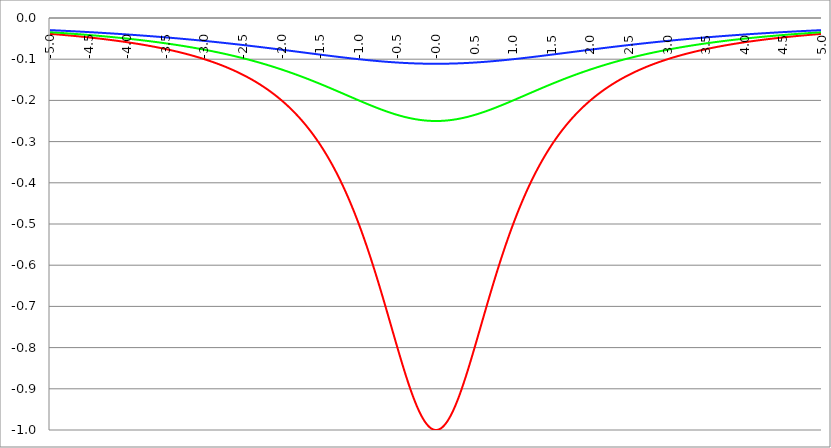
| Category | Series 1 | Series 0 | Series 2 |
|---|---|---|---|
| -5.0 | -0.038 | -0.034 | -0.029 |
| -4.995 | -0.039 | -0.035 | -0.029 |
| -4.99 | -0.039 | -0.035 | -0.029 |
| -4.985 | -0.039 | -0.035 | -0.03 |
| -4.98 | -0.039 | -0.035 | -0.03 |
| -4.975 | -0.039 | -0.035 | -0.03 |
| -4.97 | -0.039 | -0.035 | -0.03 |
| -4.965000000000001 | -0.039 | -0.035 | -0.03 |
| -4.960000000000001 | -0.039 | -0.035 | -0.03 |
| -4.955000000000001 | -0.039 | -0.035 | -0.03 |
| -4.950000000000001 | -0.039 | -0.035 | -0.03 |
| -4.945000000000001 | -0.039 | -0.035 | -0.03 |
| -4.940000000000001 | -0.039 | -0.035 | -0.03 |
| -4.935000000000001 | -0.039 | -0.035 | -0.03 |
| -4.930000000000001 | -0.04 | -0.035 | -0.03 |
| -4.925000000000002 | -0.04 | -0.035 | -0.03 |
| -4.920000000000002 | -0.04 | -0.035 | -0.03 |
| -4.915000000000002 | -0.04 | -0.036 | -0.03 |
| -4.910000000000002 | -0.04 | -0.036 | -0.03 |
| -4.905000000000002 | -0.04 | -0.036 | -0.03 |
| -4.900000000000002 | -0.04 | -0.036 | -0.03 |
| -4.895000000000002 | -0.04 | -0.036 | -0.03 |
| -4.890000000000002 | -0.04 | -0.036 | -0.03 |
| -4.885000000000002 | -0.04 | -0.036 | -0.03 |
| -4.880000000000002 | -0.04 | -0.036 | -0.03 |
| -4.875000000000003 | -0.04 | -0.036 | -0.031 |
| -4.870000000000003 | -0.04 | -0.036 | -0.031 |
| -4.865000000000003 | -0.041 | -0.036 | -0.031 |
| -4.860000000000003 | -0.041 | -0.036 | -0.031 |
| -4.855000000000003 | -0.041 | -0.036 | -0.031 |
| -4.850000000000003 | -0.041 | -0.036 | -0.031 |
| -4.845000000000003 | -0.041 | -0.036 | -0.031 |
| -4.840000000000003 | -0.041 | -0.036 | -0.031 |
| -4.835000000000003 | -0.041 | -0.037 | -0.031 |
| -4.830000000000004 | -0.041 | -0.037 | -0.031 |
| -4.825000000000004 | -0.041 | -0.037 | -0.031 |
| -4.820000000000004 | -0.041 | -0.037 | -0.031 |
| -4.815000000000004 | -0.041 | -0.037 | -0.031 |
| -4.810000000000004 | -0.041 | -0.037 | -0.031 |
| -4.805000000000004 | -0.042 | -0.037 | -0.031 |
| -4.800000000000004 | -0.042 | -0.037 | -0.031 |
| -4.795000000000004 | -0.042 | -0.037 | -0.031 |
| -4.790000000000004 | -0.042 | -0.037 | -0.031 |
| -4.785000000000004 | -0.042 | -0.037 | -0.031 |
| -4.780000000000004 | -0.042 | -0.037 | -0.031 |
| -4.775000000000004 | -0.042 | -0.037 | -0.031 |
| -4.770000000000004 | -0.042 | -0.037 | -0.031 |
| -4.765000000000005 | -0.042 | -0.037 | -0.032 |
| -4.760000000000005 | -0.042 | -0.038 | -0.032 |
| -4.755000000000005 | -0.042 | -0.038 | -0.032 |
| -4.750000000000005 | -0.042 | -0.038 | -0.032 |
| -4.745000000000005 | -0.043 | -0.038 | -0.032 |
| -4.740000000000005 | -0.043 | -0.038 | -0.032 |
| -4.735000000000005 | -0.043 | -0.038 | -0.032 |
| -4.730000000000005 | -0.043 | -0.038 | -0.032 |
| -4.725000000000006 | -0.043 | -0.038 | -0.032 |
| -4.720000000000006 | -0.043 | -0.038 | -0.032 |
| -4.715000000000006 | -0.043 | -0.038 | -0.032 |
| -4.710000000000006 | -0.043 | -0.038 | -0.032 |
| -4.705000000000006 | -0.043 | -0.038 | -0.032 |
| -4.700000000000006 | -0.043 | -0.038 | -0.032 |
| -4.695000000000006 | -0.043 | -0.038 | -0.032 |
| -4.690000000000006 | -0.043 | -0.038 | -0.032 |
| -4.685000000000007 | -0.044 | -0.039 | -0.032 |
| -4.680000000000007 | -0.044 | -0.039 | -0.032 |
| -4.675000000000007 | -0.044 | -0.039 | -0.032 |
| -4.670000000000007 | -0.044 | -0.039 | -0.032 |
| -4.665000000000007 | -0.044 | -0.039 | -0.033 |
| -4.660000000000007 | -0.044 | -0.039 | -0.033 |
| -4.655000000000007 | -0.044 | -0.039 | -0.033 |
| -4.650000000000007 | -0.044 | -0.039 | -0.033 |
| -4.645000000000007 | -0.044 | -0.039 | -0.033 |
| -4.640000000000008 | -0.044 | -0.039 | -0.033 |
| -4.635000000000008 | -0.044 | -0.039 | -0.033 |
| -4.630000000000008 | -0.045 | -0.039 | -0.033 |
| -4.625000000000008 | -0.045 | -0.039 | -0.033 |
| -4.620000000000008 | -0.045 | -0.039 | -0.033 |
| -4.615000000000008 | -0.045 | -0.04 | -0.033 |
| -4.610000000000008 | -0.045 | -0.04 | -0.033 |
| -4.605000000000008 | -0.045 | -0.04 | -0.033 |
| -4.600000000000008 | -0.045 | -0.04 | -0.033 |
| -4.595000000000009 | -0.045 | -0.04 | -0.033 |
| -4.590000000000009 | -0.045 | -0.04 | -0.033 |
| -4.585000000000009 | -0.045 | -0.04 | -0.033 |
| -4.580000000000009 | -0.046 | -0.04 | -0.033 |
| -4.57500000000001 | -0.046 | -0.04 | -0.033 |
| -4.57000000000001 | -0.046 | -0.04 | -0.033 |
| -4.565000000000009 | -0.046 | -0.04 | -0.034 |
| -4.560000000000009 | -0.046 | -0.04 | -0.034 |
| -4.555000000000009 | -0.046 | -0.04 | -0.034 |
| -4.55000000000001 | -0.046 | -0.04 | -0.034 |
| -4.54500000000001 | -0.046 | -0.041 | -0.034 |
| -4.54000000000001 | -0.046 | -0.041 | -0.034 |
| -4.53500000000001 | -0.046 | -0.041 | -0.034 |
| -4.53000000000001 | -0.046 | -0.041 | -0.034 |
| -4.52500000000001 | -0.047 | -0.041 | -0.034 |
| -4.52000000000001 | -0.047 | -0.041 | -0.034 |
| -4.51500000000001 | -0.047 | -0.041 | -0.034 |
| -4.51000000000001 | -0.047 | -0.041 | -0.034 |
| -4.505000000000011 | -0.047 | -0.041 | -0.034 |
| -4.500000000000011 | -0.047 | -0.041 | -0.034 |
| -4.495000000000011 | -0.047 | -0.041 | -0.034 |
| -4.490000000000011 | -0.047 | -0.041 | -0.034 |
| -4.485000000000011 | -0.047 | -0.041 | -0.034 |
| -4.480000000000011 | -0.047 | -0.042 | -0.034 |
| -4.475000000000011 | -0.048 | -0.042 | -0.034 |
| -4.470000000000011 | -0.048 | -0.042 | -0.035 |
| -4.465000000000011 | -0.048 | -0.042 | -0.035 |
| -4.460000000000011 | -0.048 | -0.042 | -0.035 |
| -4.455000000000012 | -0.048 | -0.042 | -0.035 |
| -4.450000000000012 | -0.048 | -0.042 | -0.035 |
| -4.445000000000012 | -0.048 | -0.042 | -0.035 |
| -4.440000000000012 | -0.048 | -0.042 | -0.035 |
| -4.435000000000012 | -0.048 | -0.042 | -0.035 |
| -4.430000000000012 | -0.048 | -0.042 | -0.035 |
| -4.425000000000012 | -0.049 | -0.042 | -0.035 |
| -4.420000000000012 | -0.049 | -0.042 | -0.035 |
| -4.415000000000012 | -0.049 | -0.043 | -0.035 |
| -4.410000000000013 | -0.049 | -0.043 | -0.035 |
| -4.405000000000013 | -0.049 | -0.043 | -0.035 |
| -4.400000000000013 | -0.049 | -0.043 | -0.035 |
| -4.395000000000013 | -0.049 | -0.043 | -0.035 |
| -4.390000000000013 | -0.049 | -0.043 | -0.035 |
| -4.385000000000013 | -0.049 | -0.043 | -0.035 |
| -4.380000000000013 | -0.05 | -0.043 | -0.035 |
| -4.375000000000013 | -0.05 | -0.043 | -0.036 |
| -4.370000000000013 | -0.05 | -0.043 | -0.036 |
| -4.365000000000013 | -0.05 | -0.043 | -0.036 |
| -4.360000000000014 | -0.05 | -0.043 | -0.036 |
| -4.355000000000014 | -0.05 | -0.044 | -0.036 |
| -4.350000000000014 | -0.05 | -0.044 | -0.036 |
| -4.345000000000014 | -0.05 | -0.044 | -0.036 |
| -4.340000000000014 | -0.05 | -0.044 | -0.036 |
| -4.335000000000014 | -0.051 | -0.044 | -0.036 |
| -4.330000000000014 | -0.051 | -0.044 | -0.036 |
| -4.325000000000014 | -0.051 | -0.044 | -0.036 |
| -4.320000000000014 | -0.051 | -0.044 | -0.036 |
| -4.315000000000015 | -0.051 | -0.044 | -0.036 |
| -4.310000000000015 | -0.051 | -0.044 | -0.036 |
| -4.305000000000015 | -0.051 | -0.044 | -0.036 |
| -4.300000000000015 | -0.051 | -0.044 | -0.036 |
| -4.295000000000015 | -0.051 | -0.045 | -0.036 |
| -4.290000000000015 | -0.052 | -0.045 | -0.036 |
| -4.285000000000015 | -0.052 | -0.045 | -0.037 |
| -4.280000000000015 | -0.052 | -0.045 | -0.037 |
| -4.275000000000015 | -0.052 | -0.045 | -0.037 |
| -4.270000000000015 | -0.052 | -0.045 | -0.037 |
| -4.265000000000016 | -0.052 | -0.045 | -0.037 |
| -4.260000000000016 | -0.052 | -0.045 | -0.037 |
| -4.255000000000016 | -0.052 | -0.045 | -0.037 |
| -4.250000000000016 | -0.052 | -0.045 | -0.037 |
| -4.245000000000016 | -0.053 | -0.045 | -0.037 |
| -4.240000000000016 | -0.053 | -0.046 | -0.037 |
| -4.235000000000016 | -0.053 | -0.046 | -0.037 |
| -4.230000000000016 | -0.053 | -0.046 | -0.037 |
| -4.225000000000017 | -0.053 | -0.046 | -0.037 |
| -4.220000000000017 | -0.053 | -0.046 | -0.037 |
| -4.215000000000017 | -0.053 | -0.046 | -0.037 |
| -4.210000000000017 | -0.053 | -0.046 | -0.037 |
| -4.205000000000017 | -0.054 | -0.046 | -0.037 |
| -4.200000000000017 | -0.054 | -0.046 | -0.038 |
| -4.195000000000017 | -0.054 | -0.046 | -0.038 |
| -4.190000000000017 | -0.054 | -0.046 | -0.038 |
| -4.185000000000017 | -0.054 | -0.046 | -0.038 |
| -4.180000000000017 | -0.054 | -0.047 | -0.038 |
| -4.175000000000018 | -0.054 | -0.047 | -0.038 |
| -4.170000000000018 | -0.054 | -0.047 | -0.038 |
| -4.165000000000018 | -0.055 | -0.047 | -0.038 |
| -4.160000000000018 | -0.055 | -0.047 | -0.038 |
| -4.155000000000018 | -0.055 | -0.047 | -0.038 |
| -4.150000000000018 | -0.055 | -0.047 | -0.038 |
| -4.145000000000018 | -0.055 | -0.047 | -0.038 |
| -4.140000000000018 | -0.055 | -0.047 | -0.038 |
| -4.135000000000018 | -0.055 | -0.047 | -0.038 |
| -4.130000000000019 | -0.055 | -0.047 | -0.038 |
| -4.125000000000019 | -0.056 | -0.048 | -0.038 |
| -4.120000000000019 | -0.056 | -0.048 | -0.038 |
| -4.115000000000019 | -0.056 | -0.048 | -0.039 |
| -4.110000000000019 | -0.056 | -0.048 | -0.039 |
| -4.105000000000019 | -0.056 | -0.048 | -0.039 |
| -4.100000000000019 | -0.056 | -0.048 | -0.039 |
| -4.095000000000019 | -0.056 | -0.048 | -0.039 |
| -4.090000000000019 | -0.056 | -0.048 | -0.039 |
| -4.085000000000019 | -0.057 | -0.048 | -0.039 |
| -4.08000000000002 | -0.057 | -0.048 | -0.039 |
| -4.07500000000002 | -0.057 | -0.049 | -0.039 |
| -4.07000000000002 | -0.057 | -0.049 | -0.039 |
| -4.06500000000002 | -0.057 | -0.049 | -0.039 |
| -4.06000000000002 | -0.057 | -0.049 | -0.039 |
| -4.05500000000002 | -0.057 | -0.049 | -0.039 |
| -4.05000000000002 | -0.057 | -0.049 | -0.039 |
| -4.04500000000002 | -0.058 | -0.049 | -0.039 |
| -4.04000000000002 | -0.058 | -0.049 | -0.039 |
| -4.03500000000002 | -0.058 | -0.049 | -0.04 |
| -4.03000000000002 | -0.058 | -0.049 | -0.04 |
| -4.025000000000021 | -0.058 | -0.05 | -0.04 |
| -4.020000000000021 | -0.058 | -0.05 | -0.04 |
| -4.015000000000021 | -0.058 | -0.05 | -0.04 |
| -4.010000000000021 | -0.059 | -0.05 | -0.04 |
| -4.005000000000021 | -0.059 | -0.05 | -0.04 |
| -4.000000000000021 | -0.059 | -0.05 | -0.04 |
| -3.995000000000021 | -0.059 | -0.05 | -0.04 |
| -3.990000000000021 | -0.059 | -0.05 | -0.04 |
| -3.985000000000022 | -0.059 | -0.05 | -0.04 |
| -3.980000000000022 | -0.059 | -0.05 | -0.04 |
| -3.975000000000022 | -0.06 | -0.051 | -0.04 |
| -3.970000000000022 | -0.06 | -0.051 | -0.04 |
| -3.965000000000022 | -0.06 | -0.051 | -0.04 |
| -3.960000000000022 | -0.06 | -0.051 | -0.041 |
| -3.955000000000022 | -0.06 | -0.051 | -0.041 |
| -3.950000000000022 | -0.06 | -0.051 | -0.041 |
| -3.945000000000022 | -0.06 | -0.051 | -0.041 |
| -3.940000000000023 | -0.061 | -0.051 | -0.041 |
| -3.935000000000023 | -0.061 | -0.051 | -0.041 |
| -3.930000000000023 | -0.061 | -0.051 | -0.041 |
| -3.925000000000023 | -0.061 | -0.052 | -0.041 |
| -3.920000000000023 | -0.061 | -0.052 | -0.041 |
| -3.915000000000023 | -0.061 | -0.052 | -0.041 |
| -3.910000000000023 | -0.061 | -0.052 | -0.041 |
| -3.905000000000023 | -0.062 | -0.052 | -0.041 |
| -3.900000000000023 | -0.062 | -0.052 | -0.041 |
| -3.895000000000023 | -0.062 | -0.052 | -0.041 |
| -3.890000000000024 | -0.062 | -0.052 | -0.041 |
| -3.885000000000024 | -0.062 | -0.052 | -0.042 |
| -3.880000000000024 | -0.062 | -0.052 | -0.042 |
| -3.875000000000024 | -0.062 | -0.053 | -0.042 |
| -3.870000000000024 | -0.063 | -0.053 | -0.042 |
| -3.865000000000024 | -0.063 | -0.053 | -0.042 |
| -3.860000000000024 | -0.063 | -0.053 | -0.042 |
| -3.855000000000024 | -0.063 | -0.053 | -0.042 |
| -3.850000000000024 | -0.063 | -0.053 | -0.042 |
| -3.845000000000025 | -0.063 | -0.053 | -0.042 |
| -3.840000000000025 | -0.064 | -0.053 | -0.042 |
| -3.835000000000025 | -0.064 | -0.053 | -0.042 |
| -3.830000000000025 | -0.064 | -0.054 | -0.042 |
| -3.825000000000025 | -0.064 | -0.054 | -0.042 |
| -3.820000000000025 | -0.064 | -0.054 | -0.042 |
| -3.815000000000025 | -0.064 | -0.054 | -0.042 |
| -3.810000000000025 | -0.064 | -0.054 | -0.043 |
| -3.805000000000025 | -0.065 | -0.054 | -0.043 |
| -3.800000000000026 | -0.065 | -0.054 | -0.043 |
| -3.795000000000026 | -0.065 | -0.054 | -0.043 |
| -3.790000000000026 | -0.065 | -0.054 | -0.043 |
| -3.785000000000026 | -0.065 | -0.055 | -0.043 |
| -3.780000000000026 | -0.065 | -0.055 | -0.043 |
| -3.775000000000026 | -0.066 | -0.055 | -0.043 |
| -3.770000000000026 | -0.066 | -0.055 | -0.043 |
| -3.765000000000026 | -0.066 | -0.055 | -0.043 |
| -3.760000000000026 | -0.066 | -0.055 | -0.043 |
| -3.755000000000026 | -0.066 | -0.055 | -0.043 |
| -3.750000000000027 | -0.066 | -0.055 | -0.043 |
| -3.745000000000027 | -0.067 | -0.055 | -0.043 |
| -3.740000000000027 | -0.067 | -0.056 | -0.044 |
| -3.735000000000027 | -0.067 | -0.056 | -0.044 |
| -3.730000000000027 | -0.067 | -0.056 | -0.044 |
| -3.725000000000027 | -0.067 | -0.056 | -0.044 |
| -3.720000000000027 | -0.067 | -0.056 | -0.044 |
| -3.715000000000027 | -0.068 | -0.056 | -0.044 |
| -3.710000000000027 | -0.068 | -0.056 | -0.044 |
| -3.705000000000028 | -0.068 | -0.056 | -0.044 |
| -3.700000000000028 | -0.068 | -0.057 | -0.044 |
| -3.695000000000028 | -0.068 | -0.057 | -0.044 |
| -3.690000000000028 | -0.068 | -0.057 | -0.044 |
| -3.685000000000028 | -0.069 | -0.057 | -0.044 |
| -3.680000000000028 | -0.069 | -0.057 | -0.044 |
| -3.675000000000028 | -0.069 | -0.057 | -0.044 |
| -3.670000000000028 | -0.069 | -0.057 | -0.045 |
| -3.665000000000028 | -0.069 | -0.057 | -0.045 |
| -3.660000000000028 | -0.069 | -0.057 | -0.045 |
| -3.655000000000029 | -0.07 | -0.058 | -0.045 |
| -3.650000000000029 | -0.07 | -0.058 | -0.045 |
| -3.645000000000029 | -0.07 | -0.058 | -0.045 |
| -3.640000000000029 | -0.07 | -0.058 | -0.045 |
| -3.635000000000029 | -0.07 | -0.058 | -0.045 |
| -3.630000000000029 | -0.071 | -0.058 | -0.045 |
| -3.625000000000029 | -0.071 | -0.058 | -0.045 |
| -3.620000000000029 | -0.071 | -0.058 | -0.045 |
| -3.615000000000029 | -0.071 | -0.059 | -0.045 |
| -3.61000000000003 | -0.071 | -0.059 | -0.045 |
| -3.60500000000003 | -0.071 | -0.059 | -0.045 |
| -3.60000000000003 | -0.072 | -0.059 | -0.046 |
| -3.59500000000003 | -0.072 | -0.059 | -0.046 |
| -3.59000000000003 | -0.072 | -0.059 | -0.046 |
| -3.58500000000003 | -0.072 | -0.059 | -0.046 |
| -3.58000000000003 | -0.072 | -0.059 | -0.046 |
| -3.57500000000003 | -0.073 | -0.06 | -0.046 |
| -3.57000000000003 | -0.073 | -0.06 | -0.046 |
| -3.565000000000031 | -0.073 | -0.06 | -0.046 |
| -3.560000000000031 | -0.073 | -0.06 | -0.046 |
| -3.555000000000031 | -0.073 | -0.06 | -0.046 |
| -3.550000000000031 | -0.074 | -0.06 | -0.046 |
| -3.545000000000031 | -0.074 | -0.06 | -0.046 |
| -3.540000000000031 | -0.074 | -0.06 | -0.046 |
| -3.535000000000031 | -0.074 | -0.061 | -0.047 |
| -3.530000000000031 | -0.074 | -0.061 | -0.047 |
| -3.525000000000031 | -0.074 | -0.061 | -0.047 |
| -3.520000000000032 | -0.075 | -0.061 | -0.047 |
| -3.515000000000032 | -0.075 | -0.061 | -0.047 |
| -3.510000000000032 | -0.075 | -0.061 | -0.047 |
| -3.505000000000032 | -0.075 | -0.061 | -0.047 |
| -3.500000000000032 | -0.075 | -0.062 | -0.047 |
| -3.495000000000032 | -0.076 | -0.062 | -0.047 |
| -3.490000000000032 | -0.076 | -0.062 | -0.047 |
| -3.485000000000032 | -0.076 | -0.062 | -0.047 |
| -3.480000000000032 | -0.076 | -0.062 | -0.047 |
| -3.475000000000032 | -0.076 | -0.062 | -0.047 |
| -3.470000000000033 | -0.077 | -0.062 | -0.048 |
| -3.465000000000033 | -0.077 | -0.062 | -0.048 |
| -3.460000000000033 | -0.077 | -0.063 | -0.048 |
| -3.455000000000033 | -0.077 | -0.063 | -0.048 |
| -3.450000000000033 | -0.078 | -0.063 | -0.048 |
| -3.445000000000033 | -0.078 | -0.063 | -0.048 |
| -3.440000000000033 | -0.078 | -0.063 | -0.048 |
| -3.435000000000033 | -0.078 | -0.063 | -0.048 |
| -3.430000000000033 | -0.078 | -0.063 | -0.048 |
| -3.425000000000034 | -0.079 | -0.064 | -0.048 |
| -3.420000000000034 | -0.079 | -0.064 | -0.048 |
| -3.415000000000034 | -0.079 | -0.064 | -0.048 |
| -3.410000000000034 | -0.079 | -0.064 | -0.048 |
| -3.405000000000034 | -0.079 | -0.064 | -0.049 |
| -3.400000000000034 | -0.08 | -0.064 | -0.049 |
| -3.395000000000034 | -0.08 | -0.064 | -0.049 |
| -3.390000000000034 | -0.08 | -0.065 | -0.049 |
| -3.385000000000034 | -0.08 | -0.065 | -0.049 |
| -3.380000000000034 | -0.08 | -0.065 | -0.049 |
| -3.375000000000035 | -0.081 | -0.065 | -0.049 |
| -3.370000000000035 | -0.081 | -0.065 | -0.049 |
| -3.365000000000035 | -0.081 | -0.065 | -0.049 |
| -3.360000000000035 | -0.081 | -0.065 | -0.049 |
| -3.355000000000035 | -0.082 | -0.066 | -0.049 |
| -3.350000000000035 | -0.082 | -0.066 | -0.049 |
| -3.345000000000035 | -0.082 | -0.066 | -0.05 |
| -3.340000000000035 | -0.082 | -0.066 | -0.05 |
| -3.335000000000035 | -0.082 | -0.066 | -0.05 |
| -3.330000000000036 | -0.083 | -0.066 | -0.05 |
| -3.325000000000036 | -0.083 | -0.066 | -0.05 |
| -3.320000000000036 | -0.083 | -0.067 | -0.05 |
| -3.315000000000036 | -0.083 | -0.067 | -0.05 |
| -3.310000000000036 | -0.084 | -0.067 | -0.05 |
| -3.305000000000036 | -0.084 | -0.067 | -0.05 |
| -3.300000000000036 | -0.084 | -0.067 | -0.05 |
| -3.295000000000036 | -0.084 | -0.067 | -0.05 |
| -3.290000000000036 | -0.085 | -0.067 | -0.05 |
| -3.285000000000036 | -0.085 | -0.068 | -0.051 |
| -3.280000000000036 | -0.085 | -0.068 | -0.051 |
| -3.275000000000037 | -0.085 | -0.068 | -0.051 |
| -3.270000000000037 | -0.086 | -0.068 | -0.051 |
| -3.265000000000037 | -0.086 | -0.068 | -0.051 |
| -3.260000000000037 | -0.086 | -0.068 | -0.051 |
| -3.255000000000037 | -0.086 | -0.069 | -0.051 |
| -3.250000000000037 | -0.086 | -0.069 | -0.051 |
| -3.245000000000037 | -0.087 | -0.069 | -0.051 |
| -3.240000000000037 | -0.087 | -0.069 | -0.051 |
| -3.235000000000038 | -0.087 | -0.069 | -0.051 |
| -3.230000000000038 | -0.087 | -0.069 | -0.051 |
| -3.225000000000038 | -0.088 | -0.069 | -0.052 |
| -3.220000000000038 | -0.088 | -0.07 | -0.052 |
| -3.215000000000038 | -0.088 | -0.07 | -0.052 |
| -3.210000000000038 | -0.088 | -0.07 | -0.052 |
| -3.205000000000038 | -0.089 | -0.07 | -0.052 |
| -3.200000000000038 | -0.089 | -0.07 | -0.052 |
| -3.195000000000038 | -0.089 | -0.07 | -0.052 |
| -3.190000000000039 | -0.089 | -0.071 | -0.052 |
| -3.185000000000039 | -0.09 | -0.071 | -0.052 |
| -3.180000000000039 | -0.09 | -0.071 | -0.052 |
| -3.175000000000039 | -0.09 | -0.071 | -0.052 |
| -3.170000000000039 | -0.091 | -0.071 | -0.052 |
| -3.16500000000004 | -0.091 | -0.071 | -0.053 |
| -3.16000000000004 | -0.091 | -0.072 | -0.053 |
| -3.155000000000039 | -0.091 | -0.072 | -0.053 |
| -3.150000000000039 | -0.092 | -0.072 | -0.053 |
| -3.14500000000004 | -0.092 | -0.072 | -0.053 |
| -3.14000000000004 | -0.092 | -0.072 | -0.053 |
| -3.13500000000004 | -0.092 | -0.072 | -0.053 |
| -3.13000000000004 | -0.093 | -0.072 | -0.053 |
| -3.12500000000004 | -0.093 | -0.073 | -0.053 |
| -3.12000000000004 | -0.093 | -0.073 | -0.053 |
| -3.11500000000004 | -0.093 | -0.073 | -0.053 |
| -3.11000000000004 | -0.094 | -0.073 | -0.054 |
| -3.10500000000004 | -0.094 | -0.073 | -0.054 |
| -3.10000000000004 | -0.094 | -0.073 | -0.054 |
| -3.095000000000041 | -0.095 | -0.074 | -0.054 |
| -3.090000000000041 | -0.095 | -0.074 | -0.054 |
| -3.085000000000041 | -0.095 | -0.074 | -0.054 |
| -3.080000000000041 | -0.095 | -0.074 | -0.054 |
| -3.075000000000041 | -0.096 | -0.074 | -0.054 |
| -3.070000000000041 | -0.096 | -0.074 | -0.054 |
| -3.065000000000041 | -0.096 | -0.075 | -0.054 |
| -3.060000000000041 | -0.096 | -0.075 | -0.054 |
| -3.055000000000041 | -0.097 | -0.075 | -0.055 |
| -3.050000000000042 | -0.097 | -0.075 | -0.055 |
| -3.045000000000042 | -0.097 | -0.075 | -0.055 |
| -3.040000000000042 | -0.098 | -0.076 | -0.055 |
| -3.035000000000042 | -0.098 | -0.076 | -0.055 |
| -3.030000000000042 | -0.098 | -0.076 | -0.055 |
| -3.025000000000042 | -0.099 | -0.076 | -0.055 |
| -3.020000000000042 | -0.099 | -0.076 | -0.055 |
| -3.015000000000042 | -0.099 | -0.076 | -0.055 |
| -3.010000000000042 | -0.099 | -0.077 | -0.055 |
| -3.005000000000043 | -0.1 | -0.077 | -0.055 |
| -3.000000000000043 | -0.1 | -0.077 | -0.056 |
| -2.995000000000043 | -0.1 | -0.077 | -0.056 |
| -2.990000000000043 | -0.101 | -0.077 | -0.056 |
| -2.985000000000043 | -0.101 | -0.077 | -0.056 |
| -2.980000000000043 | -0.101 | -0.078 | -0.056 |
| -2.975000000000043 | -0.102 | -0.078 | -0.056 |
| -2.970000000000043 | -0.102 | -0.078 | -0.056 |
| -2.965000000000043 | -0.102 | -0.078 | -0.056 |
| -2.960000000000043 | -0.102 | -0.078 | -0.056 |
| -2.955000000000044 | -0.103 | -0.079 | -0.056 |
| -2.950000000000044 | -0.103 | -0.079 | -0.056 |
| -2.945000000000044 | -0.103 | -0.079 | -0.057 |
| -2.940000000000044 | -0.104 | -0.079 | -0.057 |
| -2.935000000000044 | -0.104 | -0.079 | -0.057 |
| -2.930000000000044 | -0.104 | -0.079 | -0.057 |
| -2.925000000000044 | -0.105 | -0.08 | -0.057 |
| -2.920000000000044 | -0.105 | -0.08 | -0.057 |
| -2.915000000000044 | -0.105 | -0.08 | -0.057 |
| -2.910000000000045 | -0.106 | -0.08 | -0.057 |
| -2.905000000000045 | -0.106 | -0.08 | -0.057 |
| -2.900000000000045 | -0.106 | -0.081 | -0.057 |
| -2.895000000000045 | -0.107 | -0.081 | -0.058 |
| -2.890000000000045 | -0.107 | -0.081 | -0.058 |
| -2.885000000000045 | -0.107 | -0.081 | -0.058 |
| -2.880000000000045 | -0.108 | -0.081 | -0.058 |
| -2.875000000000045 | -0.108 | -0.082 | -0.058 |
| -2.870000000000045 | -0.108 | -0.082 | -0.058 |
| -2.865000000000045 | -0.109 | -0.082 | -0.058 |
| -2.860000000000046 | -0.109 | -0.082 | -0.058 |
| -2.855000000000046 | -0.109 | -0.082 | -0.058 |
| -2.850000000000046 | -0.11 | -0.082 | -0.058 |
| -2.845000000000046 | -0.11 | -0.083 | -0.058 |
| -2.840000000000046 | -0.11 | -0.083 | -0.059 |
| -2.835000000000046 | -0.111 | -0.083 | -0.059 |
| -2.830000000000046 | -0.111 | -0.083 | -0.059 |
| -2.825000000000046 | -0.111 | -0.083 | -0.059 |
| -2.820000000000046 | -0.112 | -0.084 | -0.059 |
| -2.815000000000047 | -0.112 | -0.084 | -0.059 |
| -2.810000000000047 | -0.112 | -0.084 | -0.059 |
| -2.805000000000047 | -0.113 | -0.084 | -0.059 |
| -2.800000000000047 | -0.113 | -0.084 | -0.059 |
| -2.795000000000047 | -0.113 | -0.085 | -0.059 |
| -2.790000000000047 | -0.114 | -0.085 | -0.06 |
| -2.785000000000047 | -0.114 | -0.085 | -0.06 |
| -2.780000000000047 | -0.115 | -0.085 | -0.06 |
| -2.775000000000047 | -0.115 | -0.085 | -0.06 |
| -2.770000000000047 | -0.115 | -0.086 | -0.06 |
| -2.765000000000048 | -0.116 | -0.086 | -0.06 |
| -2.760000000000048 | -0.116 | -0.086 | -0.06 |
| -2.755000000000048 | -0.116 | -0.086 | -0.06 |
| -2.750000000000048 | -0.117 | -0.086 | -0.06 |
| -2.745000000000048 | -0.117 | -0.087 | -0.06 |
| -2.740000000000048 | -0.118 | -0.087 | -0.061 |
| -2.735000000000048 | -0.118 | -0.087 | -0.061 |
| -2.730000000000048 | -0.118 | -0.087 | -0.061 |
| -2.725000000000048 | -0.119 | -0.088 | -0.061 |
| -2.720000000000049 | -0.119 | -0.088 | -0.061 |
| -2.715000000000049 | -0.119 | -0.088 | -0.061 |
| -2.710000000000049 | -0.12 | -0.088 | -0.061 |
| -2.705000000000049 | -0.12 | -0.088 | -0.061 |
| -2.700000000000049 | -0.121 | -0.089 | -0.061 |
| -2.695000000000049 | -0.121 | -0.089 | -0.061 |
| -2.690000000000049 | -0.121 | -0.089 | -0.062 |
| -2.685000000000049 | -0.122 | -0.089 | -0.062 |
| -2.680000000000049 | -0.122 | -0.089 | -0.062 |
| -2.675000000000049 | -0.123 | -0.09 | -0.062 |
| -2.67000000000005 | -0.123 | -0.09 | -0.062 |
| -2.66500000000005 | -0.123 | -0.09 | -0.062 |
| -2.66000000000005 | -0.124 | -0.09 | -0.062 |
| -2.65500000000005 | -0.124 | -0.091 | -0.062 |
| -2.65000000000005 | -0.125 | -0.091 | -0.062 |
| -2.64500000000005 | -0.125 | -0.091 | -0.063 |
| -2.64000000000005 | -0.125 | -0.091 | -0.063 |
| -2.63500000000005 | -0.126 | -0.091 | -0.063 |
| -2.63000000000005 | -0.126 | -0.092 | -0.063 |
| -2.625000000000051 | -0.127 | -0.092 | -0.063 |
| -2.620000000000051 | -0.127 | -0.092 | -0.063 |
| -2.615000000000051 | -0.128 | -0.092 | -0.063 |
| -2.610000000000051 | -0.128 | -0.092 | -0.063 |
| -2.605000000000051 | -0.128 | -0.093 | -0.063 |
| -2.600000000000051 | -0.129 | -0.093 | -0.063 |
| -2.595000000000051 | -0.129 | -0.093 | -0.064 |
| -2.590000000000051 | -0.13 | -0.093 | -0.064 |
| -2.585000000000051 | -0.13 | -0.094 | -0.064 |
| -2.580000000000052 | -0.131 | -0.094 | -0.064 |
| -2.575000000000052 | -0.131 | -0.094 | -0.064 |
| -2.570000000000052 | -0.131 | -0.094 | -0.064 |
| -2.565000000000052 | -0.132 | -0.095 | -0.064 |
| -2.560000000000052 | -0.132 | -0.095 | -0.064 |
| -2.555000000000052 | -0.133 | -0.095 | -0.064 |
| -2.550000000000052 | -0.133 | -0.095 | -0.065 |
| -2.545000000000052 | -0.134 | -0.095 | -0.065 |
| -2.540000000000052 | -0.134 | -0.096 | -0.065 |
| -2.535000000000053 | -0.135 | -0.096 | -0.065 |
| -2.530000000000053 | -0.135 | -0.096 | -0.065 |
| -2.525000000000053 | -0.136 | -0.096 | -0.065 |
| -2.520000000000053 | -0.136 | -0.097 | -0.065 |
| -2.515000000000053 | -0.137 | -0.097 | -0.065 |
| -2.510000000000053 | -0.137 | -0.097 | -0.065 |
| -2.505000000000053 | -0.137 | -0.097 | -0.065 |
| -2.500000000000053 | -0.138 | -0.098 | -0.066 |
| -2.495000000000053 | -0.138 | -0.098 | -0.066 |
| -2.490000000000053 | -0.139 | -0.098 | -0.066 |
| -2.485000000000054 | -0.139 | -0.098 | -0.066 |
| -2.480000000000054 | -0.14 | -0.099 | -0.066 |
| -2.475000000000054 | -0.14 | -0.099 | -0.066 |
| -2.470000000000054 | -0.141 | -0.099 | -0.066 |
| -2.465000000000054 | -0.141 | -0.099 | -0.066 |
| -2.460000000000054 | -0.142 | -0.099 | -0.066 |
| -2.455000000000054 | -0.142 | -0.1 | -0.067 |
| -2.450000000000054 | -0.143 | -0.1 | -0.067 |
| -2.445000000000054 | -0.143 | -0.1 | -0.067 |
| -2.440000000000055 | -0.144 | -0.1 | -0.067 |
| -2.435000000000055 | -0.144 | -0.101 | -0.067 |
| -2.430000000000055 | -0.145 | -0.101 | -0.067 |
| -2.425000000000055 | -0.145 | -0.101 | -0.067 |
| -2.420000000000055 | -0.146 | -0.101 | -0.067 |
| -2.415000000000055 | -0.146 | -0.102 | -0.067 |
| -2.410000000000055 | -0.147 | -0.102 | -0.068 |
| -2.405000000000055 | -0.147 | -0.102 | -0.068 |
| -2.400000000000055 | -0.148 | -0.102 | -0.068 |
| -2.395000000000055 | -0.148 | -0.103 | -0.068 |
| -2.390000000000056 | -0.149 | -0.103 | -0.068 |
| -2.385000000000056 | -0.15 | -0.103 | -0.068 |
| -2.380000000000056 | -0.15 | -0.103 | -0.068 |
| -2.375000000000056 | -0.151 | -0.104 | -0.068 |
| -2.370000000000056 | -0.151 | -0.104 | -0.068 |
| -2.365000000000056 | -0.152 | -0.104 | -0.069 |
| -2.360000000000056 | -0.152 | -0.104 | -0.069 |
| -2.355000000000056 | -0.153 | -0.105 | -0.069 |
| -2.350000000000056 | -0.153 | -0.105 | -0.069 |
| -2.345000000000057 | -0.154 | -0.105 | -0.069 |
| -2.340000000000057 | -0.154 | -0.106 | -0.069 |
| -2.335000000000057 | -0.155 | -0.106 | -0.069 |
| -2.330000000000057 | -0.156 | -0.106 | -0.069 |
| -2.325000000000057 | -0.156 | -0.106 | -0.069 |
| -2.320000000000057 | -0.157 | -0.107 | -0.07 |
| -2.315000000000057 | -0.157 | -0.107 | -0.07 |
| -2.310000000000057 | -0.158 | -0.107 | -0.07 |
| -2.305000000000057 | -0.158 | -0.107 | -0.07 |
| -2.300000000000058 | -0.159 | -0.108 | -0.07 |
| -2.295000000000058 | -0.16 | -0.108 | -0.07 |
| -2.290000000000058 | -0.16 | -0.108 | -0.07 |
| -2.285000000000058 | -0.161 | -0.108 | -0.07 |
| -2.280000000000058 | -0.161 | -0.109 | -0.07 |
| -2.275000000000058 | -0.162 | -0.109 | -0.071 |
| -2.270000000000058 | -0.163 | -0.109 | -0.071 |
| -2.265000000000058 | -0.163 | -0.11 | -0.071 |
| -2.260000000000058 | -0.164 | -0.11 | -0.071 |
| -2.255000000000058 | -0.164 | -0.11 | -0.071 |
| -2.250000000000059 | -0.165 | -0.11 | -0.071 |
| -2.245000000000059 | -0.166 | -0.111 | -0.071 |
| -2.240000000000059 | -0.166 | -0.111 | -0.071 |
| -2.235000000000059 | -0.167 | -0.111 | -0.071 |
| -2.23000000000006 | -0.167 | -0.111 | -0.072 |
| -2.22500000000006 | -0.168 | -0.112 | -0.072 |
| -2.22000000000006 | -0.169 | -0.112 | -0.072 |
| -2.215000000000059 | -0.169 | -0.112 | -0.072 |
| -2.210000000000059 | -0.17 | -0.113 | -0.072 |
| -2.20500000000006 | -0.171 | -0.113 | -0.072 |
| -2.20000000000006 | -0.171 | -0.113 | -0.072 |
| -2.19500000000006 | -0.172 | -0.113 | -0.072 |
| -2.19000000000006 | -0.173 | -0.114 | -0.072 |
| -2.18500000000006 | -0.173 | -0.114 | -0.073 |
| -2.18000000000006 | -0.174 | -0.114 | -0.073 |
| -2.17500000000006 | -0.175 | -0.115 | -0.073 |
| -2.17000000000006 | -0.175 | -0.115 | -0.073 |
| -2.16500000000006 | -0.176 | -0.115 | -0.073 |
| -2.160000000000061 | -0.177 | -0.115 | -0.073 |
| -2.155000000000061 | -0.177 | -0.116 | -0.073 |
| -2.150000000000061 | -0.178 | -0.116 | -0.073 |
| -2.145000000000061 | -0.179 | -0.116 | -0.074 |
| -2.140000000000061 | -0.179 | -0.117 | -0.074 |
| -2.135000000000061 | -0.18 | -0.117 | -0.074 |
| -2.130000000000061 | -0.181 | -0.117 | -0.074 |
| -2.125000000000061 | -0.181 | -0.117 | -0.074 |
| -2.120000000000061 | -0.182 | -0.118 | -0.074 |
| -2.115000000000061 | -0.183 | -0.118 | -0.074 |
| -2.110000000000062 | -0.183 | -0.118 | -0.074 |
| -2.105000000000062 | -0.184 | -0.119 | -0.074 |
| -2.100000000000062 | -0.185 | -0.119 | -0.075 |
| -2.095000000000062 | -0.186 | -0.119 | -0.075 |
| -2.090000000000062 | -0.186 | -0.12 | -0.075 |
| -2.085000000000062 | -0.187 | -0.12 | -0.075 |
| -2.080000000000062 | -0.188 | -0.12 | -0.075 |
| -2.075000000000062 | -0.188 | -0.12 | -0.075 |
| -2.070000000000062 | -0.189 | -0.121 | -0.075 |
| -2.065000000000063 | -0.19 | -0.121 | -0.075 |
| -2.060000000000063 | -0.191 | -0.121 | -0.076 |
| -2.055000000000063 | -0.191 | -0.122 | -0.076 |
| -2.050000000000063 | -0.192 | -0.122 | -0.076 |
| -2.045000000000063 | -0.193 | -0.122 | -0.076 |
| -2.040000000000063 | -0.194 | -0.123 | -0.076 |
| -2.035000000000063 | -0.195 | -0.123 | -0.076 |
| -2.030000000000063 | -0.195 | -0.123 | -0.076 |
| -2.025000000000063 | -0.196 | -0.123 | -0.076 |
| -2.020000000000064 | -0.197 | -0.124 | -0.076 |
| -2.015000000000064 | -0.198 | -0.124 | -0.077 |
| -2.010000000000064 | -0.198 | -0.124 | -0.077 |
| -2.005000000000064 | -0.199 | -0.125 | -0.077 |
| -2.000000000000064 | -0.2 | -0.125 | -0.077 |
| -1.995000000000064 | -0.201 | -0.125 | -0.077 |
| -1.990000000000064 | -0.202 | -0.126 | -0.077 |
| -1.985000000000064 | -0.202 | -0.126 | -0.077 |
| -1.980000000000064 | -0.203 | -0.126 | -0.077 |
| -1.975000000000064 | -0.204 | -0.127 | -0.078 |
| -1.970000000000065 | -0.205 | -0.127 | -0.078 |
| -1.965000000000065 | -0.206 | -0.127 | -0.078 |
| -1.960000000000065 | -0.207 | -0.128 | -0.078 |
| -1.955000000000065 | -0.207 | -0.128 | -0.078 |
| -1.950000000000065 | -0.208 | -0.128 | -0.078 |
| -1.945000000000065 | -0.209 | -0.128 | -0.078 |
| -1.940000000000065 | -0.21 | -0.129 | -0.078 |
| -1.935000000000065 | -0.211 | -0.129 | -0.078 |
| -1.930000000000065 | -0.212 | -0.129 | -0.079 |
| -1.925000000000066 | -0.213 | -0.13 | -0.079 |
| -1.920000000000066 | -0.213 | -0.13 | -0.079 |
| -1.915000000000066 | -0.214 | -0.13 | -0.079 |
| -1.910000000000066 | -0.215 | -0.131 | -0.079 |
| -1.905000000000066 | -0.216 | -0.131 | -0.079 |
| -1.900000000000066 | -0.217 | -0.131 | -0.079 |
| -1.895000000000066 | -0.218 | -0.132 | -0.079 |
| -1.890000000000066 | -0.219 | -0.132 | -0.08 |
| -1.885000000000066 | -0.22 | -0.132 | -0.08 |
| -1.880000000000066 | -0.221 | -0.133 | -0.08 |
| -1.875000000000067 | -0.221 | -0.133 | -0.08 |
| -1.870000000000067 | -0.222 | -0.133 | -0.08 |
| -1.865000000000067 | -0.223 | -0.134 | -0.08 |
| -1.860000000000067 | -0.224 | -0.134 | -0.08 |
| -1.855000000000067 | -0.225 | -0.134 | -0.08 |
| -1.850000000000067 | -0.226 | -0.135 | -0.08 |
| -1.845000000000067 | -0.227 | -0.135 | -0.081 |
| -1.840000000000067 | -0.228 | -0.135 | -0.081 |
| -1.835000000000067 | -0.229 | -0.136 | -0.081 |
| -1.830000000000068 | -0.23 | -0.136 | -0.081 |
| -1.825000000000068 | -0.231 | -0.136 | -0.081 |
| -1.820000000000068 | -0.232 | -0.137 | -0.081 |
| -1.815000000000068 | -0.233 | -0.137 | -0.081 |
| -1.810000000000068 | -0.234 | -0.137 | -0.081 |
| -1.805000000000068 | -0.235 | -0.138 | -0.082 |
| -1.800000000000068 | -0.236 | -0.138 | -0.082 |
| -1.795000000000068 | -0.237 | -0.138 | -0.082 |
| -1.790000000000068 | -0.238 | -0.139 | -0.082 |
| -1.785000000000068 | -0.239 | -0.139 | -0.082 |
| -1.780000000000069 | -0.24 | -0.14 | -0.082 |
| -1.775000000000069 | -0.241 | -0.14 | -0.082 |
| -1.770000000000069 | -0.242 | -0.14 | -0.082 |
| -1.765000000000069 | -0.243 | -0.141 | -0.083 |
| -1.760000000000069 | -0.244 | -0.141 | -0.083 |
| -1.75500000000007 | -0.245 | -0.141 | -0.083 |
| -1.75000000000007 | -0.246 | -0.142 | -0.083 |
| -1.745000000000069 | -0.247 | -0.142 | -0.083 |
| -1.740000000000069 | -0.248 | -0.142 | -0.083 |
| -1.73500000000007 | -0.249 | -0.143 | -0.083 |
| -1.73000000000007 | -0.25 | -0.143 | -0.083 |
| -1.72500000000007 | -0.252 | -0.143 | -0.084 |
| -1.72000000000007 | -0.253 | -0.144 | -0.084 |
| -1.71500000000007 | -0.254 | -0.144 | -0.084 |
| -1.71000000000007 | -0.255 | -0.144 | -0.084 |
| -1.70500000000007 | -0.256 | -0.145 | -0.084 |
| -1.70000000000007 | -0.257 | -0.145 | -0.084 |
| -1.69500000000007 | -0.258 | -0.145 | -0.084 |
| -1.69000000000007 | -0.259 | -0.146 | -0.084 |
| -1.685000000000071 | -0.26 | -0.146 | -0.084 |
| -1.680000000000071 | -0.262 | -0.147 | -0.085 |
| -1.675000000000071 | -0.263 | -0.147 | -0.085 |
| -1.670000000000071 | -0.264 | -0.147 | -0.085 |
| -1.665000000000071 | -0.265 | -0.148 | -0.085 |
| -1.660000000000071 | -0.266 | -0.148 | -0.085 |
| -1.655000000000071 | -0.267 | -0.148 | -0.085 |
| -1.650000000000071 | -0.269 | -0.149 | -0.085 |
| -1.645000000000071 | -0.27 | -0.149 | -0.085 |
| -1.640000000000072 | -0.271 | -0.149 | -0.086 |
| -1.635000000000072 | -0.272 | -0.15 | -0.086 |
| -1.630000000000072 | -0.273 | -0.15 | -0.086 |
| -1.625000000000072 | -0.275 | -0.151 | -0.086 |
| -1.620000000000072 | -0.276 | -0.151 | -0.086 |
| -1.615000000000072 | -0.277 | -0.151 | -0.086 |
| -1.610000000000072 | -0.278 | -0.152 | -0.086 |
| -1.605000000000072 | -0.28 | -0.152 | -0.086 |
| -1.600000000000072 | -0.281 | -0.152 | -0.087 |
| -1.595000000000073 | -0.282 | -0.153 | -0.087 |
| -1.590000000000073 | -0.283 | -0.153 | -0.087 |
| -1.585000000000073 | -0.285 | -0.154 | -0.087 |
| -1.580000000000073 | -0.286 | -0.154 | -0.087 |
| -1.575000000000073 | -0.287 | -0.154 | -0.087 |
| -1.570000000000073 | -0.289 | -0.155 | -0.087 |
| -1.565000000000073 | -0.29 | -0.155 | -0.087 |
| -1.560000000000073 | -0.291 | -0.155 | -0.087 |
| -1.555000000000073 | -0.293 | -0.156 | -0.088 |
| -1.550000000000074 | -0.294 | -0.156 | -0.088 |
| -1.545000000000074 | -0.295 | -0.157 | -0.088 |
| -1.540000000000074 | -0.297 | -0.157 | -0.088 |
| -1.535000000000074 | -0.298 | -0.157 | -0.088 |
| -1.530000000000074 | -0.299 | -0.158 | -0.088 |
| -1.525000000000074 | -0.301 | -0.158 | -0.088 |
| -1.520000000000074 | -0.302 | -0.158 | -0.088 |
| -1.515000000000074 | -0.303 | -0.159 | -0.089 |
| -1.510000000000074 | -0.305 | -0.159 | -0.089 |
| -1.505000000000074 | -0.306 | -0.16 | -0.089 |
| -1.500000000000075 | -0.308 | -0.16 | -0.089 |
| -1.495000000000075 | -0.309 | -0.16 | -0.089 |
| -1.490000000000075 | -0.311 | -0.161 | -0.089 |
| -1.485000000000075 | -0.312 | -0.161 | -0.089 |
| -1.480000000000075 | -0.313 | -0.162 | -0.089 |
| -1.475000000000075 | -0.315 | -0.162 | -0.089 |
| -1.470000000000075 | -0.316 | -0.162 | -0.09 |
| -1.465000000000075 | -0.318 | -0.163 | -0.09 |
| -1.460000000000075 | -0.319 | -0.163 | -0.09 |
| -1.455000000000076 | -0.321 | -0.163 | -0.09 |
| -1.450000000000076 | -0.322 | -0.164 | -0.09 |
| -1.445000000000076 | -0.324 | -0.164 | -0.09 |
| -1.440000000000076 | -0.325 | -0.165 | -0.09 |
| -1.435000000000076 | -0.327 | -0.165 | -0.09 |
| -1.430000000000076 | -0.328 | -0.165 | -0.091 |
| -1.425000000000076 | -0.33 | -0.166 | -0.091 |
| -1.420000000000076 | -0.332 | -0.166 | -0.091 |
| -1.415000000000076 | -0.333 | -0.167 | -0.091 |
| -1.410000000000077 | -0.335 | -0.167 | -0.091 |
| -1.405000000000077 | -0.336 | -0.167 | -0.091 |
| -1.400000000000077 | -0.338 | -0.168 | -0.091 |
| -1.395000000000077 | -0.339 | -0.168 | -0.091 |
| -1.390000000000077 | -0.341 | -0.169 | -0.091 |
| -1.385000000000077 | -0.343 | -0.169 | -0.092 |
| -1.380000000000077 | -0.344 | -0.169 | -0.092 |
| -1.375000000000077 | -0.346 | -0.17 | -0.092 |
| -1.370000000000077 | -0.348 | -0.17 | -0.092 |
| -1.365000000000077 | -0.349 | -0.171 | -0.092 |
| -1.360000000000078 | -0.351 | -0.171 | -0.092 |
| -1.355000000000078 | -0.353 | -0.171 | -0.092 |
| -1.350000000000078 | -0.354 | -0.172 | -0.092 |
| -1.345000000000078 | -0.356 | -0.172 | -0.093 |
| -1.340000000000078 | -0.358 | -0.173 | -0.093 |
| -1.335000000000078 | -0.359 | -0.173 | -0.093 |
| -1.330000000000078 | -0.361 | -0.173 | -0.093 |
| -1.325000000000078 | -0.363 | -0.174 | -0.093 |
| -1.320000000000078 | -0.365 | -0.174 | -0.093 |
| -1.315000000000079 | -0.366 | -0.175 | -0.093 |
| -1.310000000000079 | -0.368 | -0.175 | -0.093 |
| -1.305000000000079 | -0.37 | -0.175 | -0.093 |
| -1.300000000000079 | -0.372 | -0.176 | -0.094 |
| -1.295000000000079 | -0.374 | -0.176 | -0.094 |
| -1.29000000000008 | -0.375 | -0.177 | -0.094 |
| -1.285000000000079 | -0.377 | -0.177 | -0.094 |
| -1.280000000000079 | -0.379 | -0.177 | -0.094 |
| -1.275000000000079 | -0.381 | -0.178 | -0.094 |
| -1.270000000000079 | -0.383 | -0.178 | -0.094 |
| -1.26500000000008 | -0.385 | -0.179 | -0.094 |
| -1.26000000000008 | -0.386 | -0.179 | -0.094 |
| -1.25500000000008 | -0.388 | -0.179 | -0.095 |
| -1.25000000000008 | -0.39 | -0.18 | -0.095 |
| -1.24500000000008 | -0.392 | -0.18 | -0.095 |
| -1.24000000000008 | -0.394 | -0.181 | -0.095 |
| -1.23500000000008 | -0.396 | -0.181 | -0.095 |
| -1.23000000000008 | -0.398 | -0.181 | -0.095 |
| -1.22500000000008 | -0.4 | -0.182 | -0.095 |
| -1.220000000000081 | -0.402 | -0.182 | -0.095 |
| -1.215000000000081 | -0.404 | -0.183 | -0.095 |
| -1.210000000000081 | -0.406 | -0.183 | -0.096 |
| -1.205000000000081 | -0.408 | -0.183 | -0.096 |
| -1.200000000000081 | -0.41 | -0.184 | -0.096 |
| -1.195000000000081 | -0.412 | -0.184 | -0.096 |
| -1.190000000000081 | -0.414 | -0.185 | -0.096 |
| -1.185000000000081 | -0.416 | -0.185 | -0.096 |
| -1.180000000000081 | -0.418 | -0.185 | -0.096 |
| -1.175000000000082 | -0.42 | -0.186 | -0.096 |
| -1.170000000000082 | -0.422 | -0.186 | -0.096 |
| -1.165000000000082 | -0.424 | -0.187 | -0.097 |
| -1.160000000000082 | -0.426 | -0.187 | -0.097 |
| -1.155000000000082 | -0.428 | -0.187 | -0.097 |
| -1.150000000000082 | -0.431 | -0.188 | -0.097 |
| -1.145000000000082 | -0.433 | -0.188 | -0.097 |
| -1.140000000000082 | -0.435 | -0.189 | -0.097 |
| -1.135000000000082 | -0.437 | -0.189 | -0.097 |
| -1.130000000000082 | -0.439 | -0.19 | -0.097 |
| -1.125000000000083 | -0.441 | -0.19 | -0.097 |
| -1.120000000000083 | -0.444 | -0.19 | -0.098 |
| -1.115000000000083 | -0.446 | -0.191 | -0.098 |
| -1.110000000000083 | -0.448 | -0.191 | -0.098 |
| -1.105000000000083 | -0.45 | -0.192 | -0.098 |
| -1.100000000000083 | -0.452 | -0.192 | -0.098 |
| -1.095000000000083 | -0.455 | -0.192 | -0.098 |
| -1.090000000000083 | -0.457 | -0.193 | -0.098 |
| -1.085000000000083 | -0.459 | -0.193 | -0.098 |
| -1.080000000000084 | -0.462 | -0.194 | -0.098 |
| -1.075000000000084 | -0.464 | -0.194 | -0.098 |
| -1.070000000000084 | -0.466 | -0.194 | -0.099 |
| -1.065000000000084 | -0.469 | -0.195 | -0.099 |
| -1.060000000000084 | -0.471 | -0.195 | -0.099 |
| -1.055000000000084 | -0.473 | -0.196 | -0.099 |
| -1.050000000000084 | -0.476 | -0.196 | -0.099 |
| -1.045000000000084 | -0.478 | -0.196 | -0.099 |
| -1.040000000000084 | -0.48 | -0.197 | -0.099 |
| -1.035000000000085 | -0.483 | -0.197 | -0.099 |
| -1.030000000000085 | -0.485 | -0.198 | -0.099 |
| -1.025000000000085 | -0.488 | -0.198 | -0.099 |
| -1.020000000000085 | -0.49 | -0.198 | -0.1 |
| -1.015000000000085 | -0.493 | -0.199 | -0.1 |
| -1.010000000000085 | -0.495 | -0.199 | -0.1 |
| -1.005000000000085 | -0.498 | -0.2 | -0.1 |
| -1.000000000000085 | -0.5 | -0.2 | -0.1 |
| -0.995000000000085 | -0.503 | -0.2 | -0.1 |
| -0.990000000000085 | -0.505 | -0.201 | -0.1 |
| -0.985000000000085 | -0.508 | -0.201 | -0.1 |
| -0.980000000000085 | -0.51 | -0.202 | -0.1 |
| -0.975000000000085 | -0.513 | -0.202 | -0.1 |
| -0.970000000000085 | -0.515 | -0.202 | -0.101 |
| -0.965000000000085 | -0.518 | -0.203 | -0.101 |
| -0.960000000000085 | -0.52 | -0.203 | -0.101 |
| -0.955000000000085 | -0.523 | -0.204 | -0.101 |
| -0.950000000000085 | -0.526 | -0.204 | -0.101 |
| -0.945000000000085 | -0.528 | -0.204 | -0.101 |
| -0.940000000000085 | -0.531 | -0.205 | -0.101 |
| -0.935000000000085 | -0.534 | -0.205 | -0.101 |
| -0.930000000000085 | -0.536 | -0.206 | -0.101 |
| -0.925000000000085 | -0.539 | -0.206 | -0.101 |
| -0.920000000000085 | -0.542 | -0.206 | -0.102 |
| -0.915000000000085 | -0.544 | -0.207 | -0.102 |
| -0.910000000000085 | -0.547 | -0.207 | -0.102 |
| -0.905000000000085 | -0.55 | -0.208 | -0.102 |
| -0.900000000000085 | -0.552 | -0.208 | -0.102 |
| -0.895000000000085 | -0.555 | -0.208 | -0.102 |
| -0.890000000000085 | -0.558 | -0.209 | -0.102 |
| -0.885000000000085 | -0.561 | -0.209 | -0.102 |
| -0.880000000000085 | -0.564 | -0.209 | -0.102 |
| -0.875000000000085 | -0.566 | -0.21 | -0.102 |
| -0.870000000000085 | -0.569 | -0.21 | -0.102 |
| -0.865000000000085 | -0.572 | -0.211 | -0.103 |
| -0.860000000000085 | -0.575 | -0.211 | -0.103 |
| -0.855000000000085 | -0.578 | -0.211 | -0.103 |
| -0.850000000000085 | -0.581 | -0.212 | -0.103 |
| -0.845000000000085 | -0.583 | -0.212 | -0.103 |
| -0.840000000000085 | -0.586 | -0.213 | -0.103 |
| -0.835000000000085 | -0.589 | -0.213 | -0.103 |
| -0.830000000000085 | -0.592 | -0.213 | -0.103 |
| -0.825000000000085 | -0.595 | -0.214 | -0.103 |
| -0.820000000000085 | -0.598 | -0.214 | -0.103 |
| -0.815000000000085 | -0.601 | -0.214 | -0.103 |
| -0.810000000000085 | -0.604 | -0.215 | -0.104 |
| -0.805000000000085 | -0.607 | -0.215 | -0.104 |
| -0.800000000000085 | -0.61 | -0.216 | -0.104 |
| -0.795000000000085 | -0.613 | -0.216 | -0.104 |
| -0.790000000000085 | -0.616 | -0.216 | -0.104 |
| -0.785000000000085 | -0.619 | -0.217 | -0.104 |
| -0.780000000000085 | -0.622 | -0.217 | -0.104 |
| -0.775000000000085 | -0.625 | -0.217 | -0.104 |
| -0.770000000000085 | -0.628 | -0.218 | -0.104 |
| -0.765000000000085 | -0.631 | -0.218 | -0.104 |
| -0.760000000000085 | -0.634 | -0.218 | -0.104 |
| -0.755000000000085 | -0.637 | -0.219 | -0.104 |
| -0.750000000000085 | -0.64 | -0.219 | -0.105 |
| -0.745000000000085 | -0.643 | -0.22 | -0.105 |
| -0.740000000000085 | -0.646 | -0.22 | -0.105 |
| -0.735000000000085 | -0.649 | -0.22 | -0.105 |
| -0.730000000000085 | -0.652 | -0.221 | -0.105 |
| -0.725000000000085 | -0.655 | -0.221 | -0.105 |
| -0.720000000000085 | -0.659 | -0.221 | -0.105 |
| -0.715000000000085 | -0.662 | -0.222 | -0.105 |
| -0.710000000000085 | -0.665 | -0.222 | -0.105 |
| -0.705000000000085 | -0.668 | -0.222 | -0.105 |
| -0.700000000000085 | -0.671 | -0.223 | -0.105 |
| -0.695000000000085 | -0.674 | -0.223 | -0.105 |
| -0.690000000000085 | -0.677 | -0.223 | -0.106 |
| -0.685000000000085 | -0.681 | -0.224 | -0.106 |
| -0.680000000000085 | -0.684 | -0.224 | -0.106 |
| -0.675000000000085 | -0.687 | -0.224 | -0.106 |
| -0.670000000000085 | -0.69 | -0.225 | -0.106 |
| -0.665000000000085 | -0.693 | -0.225 | -0.106 |
| -0.660000000000085 | -0.697 | -0.225 | -0.106 |
| -0.655000000000085 | -0.7 | -0.226 | -0.106 |
| -0.650000000000085 | -0.703 | -0.226 | -0.106 |
| -0.645000000000085 | -0.706 | -0.226 | -0.106 |
| -0.640000000000085 | -0.709 | -0.227 | -0.106 |
| -0.635000000000085 | -0.713 | -0.227 | -0.106 |
| -0.630000000000085 | -0.716 | -0.227 | -0.106 |
| -0.625000000000085 | -0.719 | -0.228 | -0.106 |
| -0.620000000000085 | -0.722 | -0.228 | -0.107 |
| -0.615000000000085 | -0.726 | -0.228 | -0.107 |
| -0.610000000000085 | -0.729 | -0.229 | -0.107 |
| -0.605000000000085 | -0.732 | -0.229 | -0.107 |
| -0.600000000000085 | -0.735 | -0.229 | -0.107 |
| -0.595000000000085 | -0.739 | -0.23 | -0.107 |
| -0.590000000000085 | -0.742 | -0.23 | -0.107 |
| -0.585000000000085 | -0.745 | -0.23 | -0.107 |
| -0.580000000000085 | -0.748 | -0.231 | -0.107 |
| -0.575000000000085 | -0.752 | -0.231 | -0.107 |
| -0.570000000000085 | -0.755 | -0.231 | -0.107 |
| -0.565000000000085 | -0.758 | -0.232 | -0.107 |
| -0.560000000000085 | -0.761 | -0.232 | -0.107 |
| -0.555000000000085 | -0.765 | -0.232 | -0.107 |
| -0.550000000000085 | -0.768 | -0.232 | -0.107 |
| -0.545000000000085 | -0.771 | -0.233 | -0.108 |
| -0.540000000000085 | -0.774 | -0.233 | -0.108 |
| -0.535000000000085 | -0.777 | -0.233 | -0.108 |
| -0.530000000000085 | -0.781 | -0.234 | -0.108 |
| -0.525000000000085 | -0.784 | -0.234 | -0.108 |
| -0.520000000000085 | -0.787 | -0.234 | -0.108 |
| -0.515000000000085 | -0.79 | -0.234 | -0.108 |
| -0.510000000000085 | -0.794 | -0.235 | -0.108 |
| -0.505000000000085 | -0.797 | -0.235 | -0.108 |
| -0.500000000000085 | -0.8 | -0.235 | -0.108 |
| -0.495000000000085 | -0.803 | -0.236 | -0.108 |
| -0.490000000000085 | -0.806 | -0.236 | -0.108 |
| -0.485000000000085 | -0.81 | -0.236 | -0.108 |
| -0.480000000000085 | -0.813 | -0.236 | -0.108 |
| -0.475000000000085 | -0.816 | -0.237 | -0.108 |
| -0.470000000000085 | -0.819 | -0.237 | -0.108 |
| -0.465000000000085 | -0.822 | -0.237 | -0.109 |
| -0.460000000000085 | -0.825 | -0.237 | -0.109 |
| -0.455000000000085 | -0.828 | -0.238 | -0.109 |
| -0.450000000000085 | -0.832 | -0.238 | -0.109 |
| -0.445000000000085 | -0.835 | -0.238 | -0.109 |
| -0.440000000000085 | -0.838 | -0.238 | -0.109 |
| -0.435000000000085 | -0.841 | -0.239 | -0.109 |
| -0.430000000000085 | -0.844 | -0.239 | -0.109 |
| -0.425000000000085 | -0.847 | -0.239 | -0.109 |
| -0.420000000000085 | -0.85 | -0.239 | -0.109 |
| -0.415000000000085 | -0.853 | -0.24 | -0.109 |
| -0.410000000000085 | -0.856 | -0.24 | -0.109 |
| -0.405000000000085 | -0.859 | -0.24 | -0.109 |
| -0.400000000000085 | -0.862 | -0.24 | -0.109 |
| -0.395000000000085 | -0.865 | -0.241 | -0.109 |
| -0.390000000000085 | -0.868 | -0.241 | -0.109 |
| -0.385000000000085 | -0.871 | -0.241 | -0.109 |
| -0.380000000000085 | -0.874 | -0.241 | -0.109 |
| -0.375000000000085 | -0.877 | -0.242 | -0.109 |
| -0.370000000000085 | -0.88 | -0.242 | -0.109 |
| -0.365000000000085 | -0.882 | -0.242 | -0.109 |
| -0.360000000000085 | -0.885 | -0.242 | -0.11 |
| -0.355000000000085 | -0.888 | -0.242 | -0.11 |
| -0.350000000000085 | -0.891 | -0.243 | -0.11 |
| -0.345000000000085 | -0.894 | -0.243 | -0.11 |
| -0.340000000000085 | -0.896 | -0.243 | -0.11 |
| -0.335000000000085 | -0.899 | -0.243 | -0.11 |
| -0.330000000000085 | -0.902 | -0.243 | -0.11 |
| -0.325000000000085 | -0.904 | -0.244 | -0.11 |
| -0.320000000000085 | -0.907 | -0.244 | -0.11 |
| -0.315000000000085 | -0.91 | -0.244 | -0.11 |
| -0.310000000000085 | -0.912 | -0.244 | -0.11 |
| -0.305000000000085 | -0.915 | -0.244 | -0.11 |
| -0.300000000000085 | -0.917 | -0.244 | -0.11 |
| -0.295000000000085 | -0.92 | -0.245 | -0.11 |
| -0.290000000000085 | -0.922 | -0.245 | -0.11 |
| -0.285000000000085 | -0.925 | -0.245 | -0.11 |
| -0.280000000000085 | -0.927 | -0.245 | -0.11 |
| -0.275000000000085 | -0.93 | -0.245 | -0.11 |
| -0.270000000000085 | -0.932 | -0.246 | -0.11 |
| -0.265000000000085 | -0.934 | -0.246 | -0.11 |
| -0.260000000000085 | -0.937 | -0.246 | -0.11 |
| -0.255000000000085 | -0.939 | -0.246 | -0.11 |
| -0.250000000000085 | -0.941 | -0.246 | -0.11 |
| -0.245000000000085 | -0.943 | -0.246 | -0.11 |
| -0.240000000000085 | -0.946 | -0.246 | -0.11 |
| -0.235000000000085 | -0.948 | -0.247 | -0.11 |
| -0.230000000000085 | -0.95 | -0.247 | -0.11 |
| -0.225000000000085 | -0.952 | -0.247 | -0.11 |
| -0.220000000000085 | -0.954 | -0.247 | -0.111 |
| -0.215000000000085 | -0.956 | -0.247 | -0.111 |
| -0.210000000000085 | -0.958 | -0.247 | -0.111 |
| -0.205000000000085 | -0.96 | -0.247 | -0.111 |
| -0.200000000000085 | -0.962 | -0.248 | -0.111 |
| -0.195000000000085 | -0.963 | -0.248 | -0.111 |
| -0.190000000000085 | -0.965 | -0.248 | -0.111 |
| -0.185000000000085 | -0.967 | -0.248 | -0.111 |
| -0.180000000000085 | -0.969 | -0.248 | -0.111 |
| -0.175000000000085 | -0.97 | -0.248 | -0.111 |
| -0.170000000000085 | -0.972 | -0.248 | -0.111 |
| -0.165000000000085 | -0.973 | -0.248 | -0.111 |
| -0.160000000000085 | -0.975 | -0.248 | -0.111 |
| -0.155000000000084 | -0.977 | -0.249 | -0.111 |
| -0.150000000000084 | -0.978 | -0.249 | -0.111 |
| -0.145000000000084 | -0.979 | -0.249 | -0.111 |
| -0.140000000000084 | -0.981 | -0.249 | -0.111 |
| -0.135000000000084 | -0.982 | -0.249 | -0.111 |
| -0.130000000000084 | -0.983 | -0.249 | -0.111 |
| -0.125000000000084 | -0.985 | -0.249 | -0.111 |
| -0.120000000000084 | -0.986 | -0.249 | -0.111 |
| -0.115000000000084 | -0.987 | -0.249 | -0.111 |
| -0.110000000000084 | -0.988 | -0.249 | -0.111 |
| -0.105000000000084 | -0.989 | -0.249 | -0.111 |
| -0.100000000000084 | -0.99 | -0.249 | -0.111 |
| -0.0950000000000844 | -0.991 | -0.249 | -0.111 |
| -0.0900000000000844 | -0.992 | -0.249 | -0.111 |
| -0.0850000000000844 | -0.993 | -0.25 | -0.111 |
| -0.0800000000000844 | -0.994 | -0.25 | -0.111 |
| -0.0750000000000844 | -0.994 | -0.25 | -0.111 |
| -0.0700000000000844 | -0.995 | -0.25 | -0.111 |
| -0.0650000000000844 | -0.996 | -0.25 | -0.111 |
| -0.0600000000000844 | -0.996 | -0.25 | -0.111 |
| -0.0550000000000844 | -0.997 | -0.25 | -0.111 |
| -0.0500000000000844 | -0.998 | -0.25 | -0.111 |
| -0.0450000000000844 | -0.998 | -0.25 | -0.111 |
| -0.0400000000000844 | -0.998 | -0.25 | -0.111 |
| -0.0350000000000844 | -0.999 | -0.25 | -0.111 |
| -0.0300000000000844 | -0.999 | -0.25 | -0.111 |
| -0.0250000000000844 | -0.999 | -0.25 | -0.111 |
| -0.0200000000000844 | -1 | -0.25 | -0.111 |
| -0.0150000000000844 | -1 | -0.25 | -0.111 |
| -0.0100000000000844 | -1 | -0.25 | -0.111 |
| -0.00500000000008444 | -1 | -0.25 | -0.111 |
| -8.4444604087075e-14 | -1 | -0.25 | -0.111 |
| 0.00499999999991555 | -1 | -0.25 | -0.111 |
| 0.00999999999991555 | -1 | -0.25 | -0.111 |
| 0.0149999999999156 | -1 | -0.25 | -0.111 |
| 0.0199999999999156 | -1 | -0.25 | -0.111 |
| 0.0249999999999156 | -0.999 | -0.25 | -0.111 |
| 0.0299999999999156 | -0.999 | -0.25 | -0.111 |
| 0.0349999999999155 | -0.999 | -0.25 | -0.111 |
| 0.0399999999999155 | -0.998 | -0.25 | -0.111 |
| 0.0449999999999155 | -0.998 | -0.25 | -0.111 |
| 0.0499999999999155 | -0.998 | -0.25 | -0.111 |
| 0.0549999999999155 | -0.997 | -0.25 | -0.111 |
| 0.0599999999999155 | -0.996 | -0.25 | -0.111 |
| 0.0649999999999155 | -0.996 | -0.25 | -0.111 |
| 0.0699999999999155 | -0.995 | -0.25 | -0.111 |
| 0.0749999999999155 | -0.994 | -0.25 | -0.111 |
| 0.0799999999999155 | -0.994 | -0.25 | -0.111 |
| 0.0849999999999155 | -0.993 | -0.25 | -0.111 |
| 0.0899999999999155 | -0.992 | -0.249 | -0.111 |
| 0.0949999999999155 | -0.991 | -0.249 | -0.111 |
| 0.0999999999999155 | -0.99 | -0.249 | -0.111 |
| 0.104999999999916 | -0.989 | -0.249 | -0.111 |
| 0.109999999999916 | -0.988 | -0.249 | -0.111 |
| 0.114999999999916 | -0.987 | -0.249 | -0.111 |
| 0.119999999999916 | -0.986 | -0.249 | -0.111 |
| 0.124999999999916 | -0.985 | -0.249 | -0.111 |
| 0.129999999999916 | -0.983 | -0.249 | -0.111 |
| 0.134999999999916 | -0.982 | -0.249 | -0.111 |
| 0.139999999999916 | -0.981 | -0.249 | -0.111 |
| 0.144999999999916 | -0.979 | -0.249 | -0.111 |
| 0.149999999999916 | -0.978 | -0.249 | -0.111 |
| 0.154999999999916 | -0.977 | -0.249 | -0.111 |
| 0.159999999999916 | -0.975 | -0.248 | -0.111 |
| 0.164999999999916 | -0.973 | -0.248 | -0.111 |
| 0.169999999999916 | -0.972 | -0.248 | -0.111 |
| 0.174999999999916 | -0.97 | -0.248 | -0.111 |
| 0.179999999999916 | -0.969 | -0.248 | -0.111 |
| 0.184999999999916 | -0.967 | -0.248 | -0.111 |
| 0.189999999999916 | -0.965 | -0.248 | -0.111 |
| 0.194999999999916 | -0.963 | -0.248 | -0.111 |
| 0.199999999999916 | -0.962 | -0.248 | -0.111 |
| 0.204999999999916 | -0.96 | -0.247 | -0.111 |
| 0.209999999999916 | -0.958 | -0.247 | -0.111 |
| 0.214999999999916 | -0.956 | -0.247 | -0.111 |
| 0.219999999999916 | -0.954 | -0.247 | -0.111 |
| 0.224999999999916 | -0.952 | -0.247 | -0.11 |
| 0.229999999999916 | -0.95 | -0.247 | -0.11 |
| 0.234999999999916 | -0.948 | -0.247 | -0.11 |
| 0.239999999999916 | -0.946 | -0.246 | -0.11 |
| 0.244999999999916 | -0.943 | -0.246 | -0.11 |
| 0.249999999999916 | -0.941 | -0.246 | -0.11 |
| 0.254999999999916 | -0.939 | -0.246 | -0.11 |
| 0.259999999999916 | -0.937 | -0.246 | -0.11 |
| 0.264999999999916 | -0.934 | -0.246 | -0.11 |
| 0.269999999999916 | -0.932 | -0.246 | -0.11 |
| 0.274999999999916 | -0.93 | -0.245 | -0.11 |
| 0.279999999999916 | -0.927 | -0.245 | -0.11 |
| 0.284999999999916 | -0.925 | -0.245 | -0.11 |
| 0.289999999999916 | -0.922 | -0.245 | -0.11 |
| 0.294999999999916 | -0.92 | -0.245 | -0.11 |
| 0.299999999999916 | -0.917 | -0.244 | -0.11 |
| 0.304999999999916 | -0.915 | -0.244 | -0.11 |
| 0.309999999999916 | -0.912 | -0.244 | -0.11 |
| 0.314999999999916 | -0.91 | -0.244 | -0.11 |
| 0.319999999999916 | -0.907 | -0.244 | -0.11 |
| 0.324999999999916 | -0.904 | -0.244 | -0.11 |
| 0.329999999999916 | -0.902 | -0.243 | -0.11 |
| 0.334999999999916 | -0.899 | -0.243 | -0.11 |
| 0.339999999999916 | -0.896 | -0.243 | -0.11 |
| 0.344999999999916 | -0.894 | -0.243 | -0.11 |
| 0.349999999999916 | -0.891 | -0.243 | -0.11 |
| 0.354999999999916 | -0.888 | -0.242 | -0.11 |
| 0.359999999999916 | -0.885 | -0.242 | -0.11 |
| 0.364999999999916 | -0.882 | -0.242 | -0.109 |
| 0.369999999999916 | -0.88 | -0.242 | -0.109 |
| 0.374999999999916 | -0.877 | -0.242 | -0.109 |
| 0.379999999999916 | -0.874 | -0.241 | -0.109 |
| 0.384999999999916 | -0.871 | -0.241 | -0.109 |
| 0.389999999999916 | -0.868 | -0.241 | -0.109 |
| 0.394999999999916 | -0.865 | -0.241 | -0.109 |
| 0.399999999999916 | -0.862 | -0.24 | -0.109 |
| 0.404999999999916 | -0.859 | -0.24 | -0.109 |
| 0.409999999999916 | -0.856 | -0.24 | -0.109 |
| 0.414999999999916 | -0.853 | -0.24 | -0.109 |
| 0.419999999999916 | -0.85 | -0.239 | -0.109 |
| 0.424999999999916 | -0.847 | -0.239 | -0.109 |
| 0.429999999999916 | -0.844 | -0.239 | -0.109 |
| 0.434999999999916 | -0.841 | -0.239 | -0.109 |
| 0.439999999999916 | -0.838 | -0.238 | -0.109 |
| 0.444999999999916 | -0.835 | -0.238 | -0.109 |
| 0.449999999999916 | -0.832 | -0.238 | -0.109 |
| 0.454999999999916 | -0.828 | -0.238 | -0.109 |
| 0.459999999999916 | -0.825 | -0.237 | -0.109 |
| 0.464999999999916 | -0.822 | -0.237 | -0.109 |
| 0.469999999999916 | -0.819 | -0.237 | -0.108 |
| 0.474999999999916 | -0.816 | -0.237 | -0.108 |
| 0.479999999999916 | -0.813 | -0.236 | -0.108 |
| 0.484999999999916 | -0.81 | -0.236 | -0.108 |
| 0.489999999999916 | -0.806 | -0.236 | -0.108 |
| 0.494999999999916 | -0.803 | -0.236 | -0.108 |
| 0.499999999999916 | -0.8 | -0.235 | -0.108 |
| 0.504999999999916 | -0.797 | -0.235 | -0.108 |
| 0.509999999999916 | -0.794 | -0.235 | -0.108 |
| 0.514999999999916 | -0.79 | -0.234 | -0.108 |
| 0.519999999999916 | -0.787 | -0.234 | -0.108 |
| 0.524999999999916 | -0.784 | -0.234 | -0.108 |
| 0.529999999999916 | -0.781 | -0.234 | -0.108 |
| 0.534999999999916 | -0.777 | -0.233 | -0.108 |
| 0.539999999999916 | -0.774 | -0.233 | -0.108 |
| 0.544999999999916 | -0.771 | -0.233 | -0.108 |
| 0.549999999999916 | -0.768 | -0.232 | -0.107 |
| 0.554999999999916 | -0.765 | -0.232 | -0.107 |
| 0.559999999999916 | -0.761 | -0.232 | -0.107 |
| 0.564999999999916 | -0.758 | -0.232 | -0.107 |
| 0.569999999999916 | -0.755 | -0.231 | -0.107 |
| 0.574999999999916 | -0.752 | -0.231 | -0.107 |
| 0.579999999999916 | -0.748 | -0.231 | -0.107 |
| 0.584999999999916 | -0.745 | -0.23 | -0.107 |
| 0.589999999999916 | -0.742 | -0.23 | -0.107 |
| 0.594999999999916 | -0.739 | -0.23 | -0.107 |
| 0.599999999999916 | -0.735 | -0.229 | -0.107 |
| 0.604999999999916 | -0.732 | -0.229 | -0.107 |
| 0.609999999999916 | -0.729 | -0.229 | -0.107 |
| 0.614999999999916 | -0.726 | -0.228 | -0.107 |
| 0.619999999999916 | -0.722 | -0.228 | -0.107 |
| 0.624999999999916 | -0.719 | -0.228 | -0.106 |
| 0.629999999999916 | -0.716 | -0.227 | -0.106 |
| 0.634999999999916 | -0.713 | -0.227 | -0.106 |
| 0.639999999999916 | -0.709 | -0.227 | -0.106 |
| 0.644999999999916 | -0.706 | -0.226 | -0.106 |
| 0.649999999999916 | -0.703 | -0.226 | -0.106 |
| 0.654999999999916 | -0.7 | -0.226 | -0.106 |
| 0.659999999999916 | -0.697 | -0.225 | -0.106 |
| 0.664999999999916 | -0.693 | -0.225 | -0.106 |
| 0.669999999999916 | -0.69 | -0.225 | -0.106 |
| 0.674999999999916 | -0.687 | -0.224 | -0.106 |
| 0.679999999999916 | -0.684 | -0.224 | -0.106 |
| 0.684999999999916 | -0.681 | -0.224 | -0.106 |
| 0.689999999999916 | -0.677 | -0.223 | -0.106 |
| 0.694999999999916 | -0.674 | -0.223 | -0.105 |
| 0.699999999999916 | -0.671 | -0.223 | -0.105 |
| 0.704999999999916 | -0.668 | -0.222 | -0.105 |
| 0.709999999999916 | -0.665 | -0.222 | -0.105 |
| 0.714999999999916 | -0.662 | -0.222 | -0.105 |
| 0.719999999999916 | -0.659 | -0.221 | -0.105 |
| 0.724999999999916 | -0.655 | -0.221 | -0.105 |
| 0.729999999999916 | -0.652 | -0.221 | -0.105 |
| 0.734999999999916 | -0.649 | -0.22 | -0.105 |
| 0.739999999999916 | -0.646 | -0.22 | -0.105 |
| 0.744999999999916 | -0.643 | -0.22 | -0.105 |
| 0.749999999999916 | -0.64 | -0.219 | -0.105 |
| 0.754999999999916 | -0.637 | -0.219 | -0.104 |
| 0.759999999999916 | -0.634 | -0.218 | -0.104 |
| 0.764999999999916 | -0.631 | -0.218 | -0.104 |
| 0.769999999999916 | -0.628 | -0.218 | -0.104 |
| 0.774999999999916 | -0.625 | -0.217 | -0.104 |
| 0.779999999999916 | -0.622 | -0.217 | -0.104 |
| 0.784999999999916 | -0.619 | -0.217 | -0.104 |
| 0.789999999999916 | -0.616 | -0.216 | -0.104 |
| 0.794999999999916 | -0.613 | -0.216 | -0.104 |
| 0.799999999999916 | -0.61 | -0.216 | -0.104 |
| 0.804999999999916 | -0.607 | -0.215 | -0.104 |
| 0.809999999999916 | -0.604 | -0.215 | -0.104 |
| 0.814999999999916 | -0.601 | -0.214 | -0.103 |
| 0.819999999999916 | -0.598 | -0.214 | -0.103 |
| 0.824999999999916 | -0.595 | -0.214 | -0.103 |
| 0.829999999999916 | -0.592 | -0.213 | -0.103 |
| 0.834999999999916 | -0.589 | -0.213 | -0.103 |
| 0.839999999999916 | -0.586 | -0.213 | -0.103 |
| 0.844999999999916 | -0.583 | -0.212 | -0.103 |
| 0.849999999999916 | -0.581 | -0.212 | -0.103 |
| 0.854999999999916 | -0.578 | -0.211 | -0.103 |
| 0.859999999999916 | -0.575 | -0.211 | -0.103 |
| 0.864999999999916 | -0.572 | -0.211 | -0.103 |
| 0.869999999999916 | -0.569 | -0.21 | -0.102 |
| 0.874999999999916 | -0.566 | -0.21 | -0.102 |
| 0.879999999999916 | -0.564 | -0.209 | -0.102 |
| 0.884999999999916 | -0.561 | -0.209 | -0.102 |
| 0.889999999999916 | -0.558 | -0.209 | -0.102 |
| 0.894999999999916 | -0.555 | -0.208 | -0.102 |
| 0.899999999999916 | -0.552 | -0.208 | -0.102 |
| 0.904999999999916 | -0.55 | -0.208 | -0.102 |
| 0.909999999999916 | -0.547 | -0.207 | -0.102 |
| 0.914999999999916 | -0.544 | -0.207 | -0.102 |
| 0.919999999999916 | -0.542 | -0.206 | -0.102 |
| 0.924999999999916 | -0.539 | -0.206 | -0.101 |
| 0.929999999999916 | -0.536 | -0.206 | -0.101 |
| 0.934999999999916 | -0.534 | -0.205 | -0.101 |
| 0.939999999999916 | -0.531 | -0.205 | -0.101 |
| 0.944999999999916 | -0.528 | -0.204 | -0.101 |
| 0.949999999999916 | -0.526 | -0.204 | -0.101 |
| 0.954999999999916 | -0.523 | -0.204 | -0.101 |
| 0.959999999999916 | -0.52 | -0.203 | -0.101 |
| 0.964999999999916 | -0.518 | -0.203 | -0.101 |
| 0.969999999999916 | -0.515 | -0.202 | -0.101 |
| 0.974999999999916 | -0.513 | -0.202 | -0.1 |
| 0.979999999999916 | -0.51 | -0.202 | -0.1 |
| 0.984999999999916 | -0.508 | -0.201 | -0.1 |
| 0.989999999999916 | -0.505 | -0.201 | -0.1 |
| 0.994999999999916 | -0.503 | -0.2 | -0.1 |
| 0.999999999999916 | -0.5 | -0.2 | -0.1 |
| 1.004999999999916 | -0.498 | -0.2 | -0.1 |
| 1.009999999999916 | -0.495 | -0.199 | -0.1 |
| 1.014999999999916 | -0.493 | -0.199 | -0.1 |
| 1.019999999999916 | -0.49 | -0.198 | -0.1 |
| 1.024999999999916 | -0.488 | -0.198 | -0.099 |
| 1.029999999999916 | -0.485 | -0.198 | -0.099 |
| 1.034999999999916 | -0.483 | -0.197 | -0.099 |
| 1.039999999999915 | -0.48 | -0.197 | -0.099 |
| 1.044999999999915 | -0.478 | -0.196 | -0.099 |
| 1.049999999999915 | -0.476 | -0.196 | -0.099 |
| 1.054999999999915 | -0.473 | -0.196 | -0.099 |
| 1.059999999999915 | -0.471 | -0.195 | -0.099 |
| 1.064999999999915 | -0.469 | -0.195 | -0.099 |
| 1.069999999999915 | -0.466 | -0.194 | -0.099 |
| 1.074999999999915 | -0.464 | -0.194 | -0.098 |
| 1.079999999999915 | -0.462 | -0.194 | -0.098 |
| 1.084999999999914 | -0.459 | -0.193 | -0.098 |
| 1.089999999999914 | -0.457 | -0.193 | -0.098 |
| 1.094999999999914 | -0.455 | -0.192 | -0.098 |
| 1.099999999999914 | -0.452 | -0.192 | -0.098 |
| 1.104999999999914 | -0.45 | -0.192 | -0.098 |
| 1.109999999999914 | -0.448 | -0.191 | -0.098 |
| 1.114999999999914 | -0.446 | -0.191 | -0.098 |
| 1.119999999999914 | -0.444 | -0.19 | -0.098 |
| 1.124999999999914 | -0.441 | -0.19 | -0.097 |
| 1.129999999999914 | -0.439 | -0.19 | -0.097 |
| 1.134999999999913 | -0.437 | -0.189 | -0.097 |
| 1.139999999999913 | -0.435 | -0.189 | -0.097 |
| 1.144999999999913 | -0.433 | -0.188 | -0.097 |
| 1.149999999999913 | -0.431 | -0.188 | -0.097 |
| 1.154999999999913 | -0.428 | -0.187 | -0.097 |
| 1.159999999999913 | -0.426 | -0.187 | -0.097 |
| 1.164999999999913 | -0.424 | -0.187 | -0.097 |
| 1.169999999999913 | -0.422 | -0.186 | -0.096 |
| 1.174999999999913 | -0.42 | -0.186 | -0.096 |
| 1.179999999999912 | -0.418 | -0.185 | -0.096 |
| 1.184999999999912 | -0.416 | -0.185 | -0.096 |
| 1.189999999999912 | -0.414 | -0.185 | -0.096 |
| 1.194999999999912 | -0.412 | -0.184 | -0.096 |
| 1.199999999999912 | -0.41 | -0.184 | -0.096 |
| 1.204999999999912 | -0.408 | -0.183 | -0.096 |
| 1.209999999999912 | -0.406 | -0.183 | -0.096 |
| 1.214999999999912 | -0.404 | -0.183 | -0.095 |
| 1.219999999999912 | -0.402 | -0.182 | -0.095 |
| 1.224999999999911 | -0.4 | -0.182 | -0.095 |
| 1.229999999999911 | -0.398 | -0.181 | -0.095 |
| 1.234999999999911 | -0.396 | -0.181 | -0.095 |
| 1.239999999999911 | -0.394 | -0.181 | -0.095 |
| 1.244999999999911 | -0.392 | -0.18 | -0.095 |
| 1.249999999999911 | -0.39 | -0.18 | -0.095 |
| 1.254999999999911 | -0.388 | -0.179 | -0.095 |
| 1.259999999999911 | -0.386 | -0.179 | -0.094 |
| 1.264999999999911 | -0.385 | -0.179 | -0.094 |
| 1.269999999999911 | -0.383 | -0.178 | -0.094 |
| 1.27499999999991 | -0.381 | -0.178 | -0.094 |
| 1.27999999999991 | -0.379 | -0.177 | -0.094 |
| 1.28499999999991 | -0.377 | -0.177 | -0.094 |
| 1.28999999999991 | -0.375 | -0.177 | -0.094 |
| 1.29499999999991 | -0.374 | -0.176 | -0.094 |
| 1.29999999999991 | -0.372 | -0.176 | -0.094 |
| 1.30499999999991 | -0.37 | -0.175 | -0.093 |
| 1.30999999999991 | -0.368 | -0.175 | -0.093 |
| 1.31499999999991 | -0.366 | -0.175 | -0.093 |
| 1.319999999999909 | -0.365 | -0.174 | -0.093 |
| 1.324999999999909 | -0.363 | -0.174 | -0.093 |
| 1.329999999999909 | -0.361 | -0.173 | -0.093 |
| 1.334999999999909 | -0.359 | -0.173 | -0.093 |
| 1.339999999999909 | -0.358 | -0.173 | -0.093 |
| 1.344999999999909 | -0.356 | -0.172 | -0.093 |
| 1.349999999999909 | -0.354 | -0.172 | -0.092 |
| 1.354999999999909 | -0.353 | -0.171 | -0.092 |
| 1.359999999999909 | -0.351 | -0.171 | -0.092 |
| 1.364999999999908 | -0.349 | -0.171 | -0.092 |
| 1.369999999999908 | -0.348 | -0.17 | -0.092 |
| 1.374999999999908 | -0.346 | -0.17 | -0.092 |
| 1.379999999999908 | -0.344 | -0.169 | -0.092 |
| 1.384999999999908 | -0.343 | -0.169 | -0.092 |
| 1.389999999999908 | -0.341 | -0.169 | -0.091 |
| 1.394999999999908 | -0.339 | -0.168 | -0.091 |
| 1.399999999999908 | -0.338 | -0.168 | -0.091 |
| 1.404999999999908 | -0.336 | -0.167 | -0.091 |
| 1.409999999999908 | -0.335 | -0.167 | -0.091 |
| 1.414999999999907 | -0.333 | -0.167 | -0.091 |
| 1.419999999999907 | -0.332 | -0.166 | -0.091 |
| 1.424999999999907 | -0.33 | -0.166 | -0.091 |
| 1.429999999999907 | -0.328 | -0.165 | -0.091 |
| 1.434999999999907 | -0.327 | -0.165 | -0.09 |
| 1.439999999999907 | -0.325 | -0.165 | -0.09 |
| 1.444999999999907 | -0.324 | -0.164 | -0.09 |
| 1.449999999999907 | -0.322 | -0.164 | -0.09 |
| 1.454999999999907 | -0.321 | -0.163 | -0.09 |
| 1.459999999999906 | -0.319 | -0.163 | -0.09 |
| 1.464999999999906 | -0.318 | -0.163 | -0.09 |
| 1.469999999999906 | -0.316 | -0.162 | -0.09 |
| 1.474999999999906 | -0.315 | -0.162 | -0.089 |
| 1.479999999999906 | -0.313 | -0.162 | -0.089 |
| 1.484999999999906 | -0.312 | -0.161 | -0.089 |
| 1.489999999999906 | -0.311 | -0.161 | -0.089 |
| 1.494999999999906 | -0.309 | -0.16 | -0.089 |
| 1.499999999999906 | -0.308 | -0.16 | -0.089 |
| 1.504999999999906 | -0.306 | -0.16 | -0.089 |
| 1.509999999999905 | -0.305 | -0.159 | -0.089 |
| 1.514999999999905 | -0.303 | -0.159 | -0.089 |
| 1.519999999999905 | -0.302 | -0.158 | -0.088 |
| 1.524999999999905 | -0.301 | -0.158 | -0.088 |
| 1.529999999999905 | -0.299 | -0.158 | -0.088 |
| 1.534999999999905 | -0.298 | -0.157 | -0.088 |
| 1.539999999999905 | -0.297 | -0.157 | -0.088 |
| 1.544999999999905 | -0.295 | -0.157 | -0.088 |
| 1.549999999999905 | -0.294 | -0.156 | -0.088 |
| 1.554999999999904 | -0.293 | -0.156 | -0.088 |
| 1.559999999999904 | -0.291 | -0.155 | -0.087 |
| 1.564999999999904 | -0.29 | -0.155 | -0.087 |
| 1.569999999999904 | -0.289 | -0.155 | -0.087 |
| 1.574999999999904 | -0.287 | -0.154 | -0.087 |
| 1.579999999999904 | -0.286 | -0.154 | -0.087 |
| 1.584999999999904 | -0.285 | -0.154 | -0.087 |
| 1.589999999999904 | -0.283 | -0.153 | -0.087 |
| 1.594999999999904 | -0.282 | -0.153 | -0.087 |
| 1.599999999999903 | -0.281 | -0.152 | -0.087 |
| 1.604999999999903 | -0.28 | -0.152 | -0.086 |
| 1.609999999999903 | -0.278 | -0.152 | -0.086 |
| 1.614999999999903 | -0.277 | -0.151 | -0.086 |
| 1.619999999999903 | -0.276 | -0.151 | -0.086 |
| 1.624999999999903 | -0.275 | -0.151 | -0.086 |
| 1.629999999999903 | -0.273 | -0.15 | -0.086 |
| 1.634999999999903 | -0.272 | -0.15 | -0.086 |
| 1.639999999999903 | -0.271 | -0.149 | -0.086 |
| 1.644999999999902 | -0.27 | -0.149 | -0.085 |
| 1.649999999999902 | -0.269 | -0.149 | -0.085 |
| 1.654999999999902 | -0.267 | -0.148 | -0.085 |
| 1.659999999999902 | -0.266 | -0.148 | -0.085 |
| 1.664999999999902 | -0.265 | -0.148 | -0.085 |
| 1.669999999999902 | -0.264 | -0.147 | -0.085 |
| 1.674999999999902 | -0.263 | -0.147 | -0.085 |
| 1.679999999999902 | -0.262 | -0.147 | -0.085 |
| 1.684999999999902 | -0.26 | -0.146 | -0.084 |
| 1.689999999999901 | -0.259 | -0.146 | -0.084 |
| 1.694999999999901 | -0.258 | -0.145 | -0.084 |
| 1.699999999999901 | -0.257 | -0.145 | -0.084 |
| 1.704999999999901 | -0.256 | -0.145 | -0.084 |
| 1.709999999999901 | -0.255 | -0.144 | -0.084 |
| 1.714999999999901 | -0.254 | -0.144 | -0.084 |
| 1.719999999999901 | -0.253 | -0.144 | -0.084 |
| 1.724999999999901 | -0.252 | -0.143 | -0.084 |
| 1.729999999999901 | -0.25 | -0.143 | -0.083 |
| 1.734999999999901 | -0.249 | -0.143 | -0.083 |
| 1.7399999999999 | -0.248 | -0.142 | -0.083 |
| 1.7449999999999 | -0.247 | -0.142 | -0.083 |
| 1.7499999999999 | -0.246 | -0.142 | -0.083 |
| 1.7549999999999 | -0.245 | -0.141 | -0.083 |
| 1.7599999999999 | -0.244 | -0.141 | -0.083 |
| 1.7649999999999 | -0.243 | -0.141 | -0.083 |
| 1.7699999999999 | -0.242 | -0.14 | -0.082 |
| 1.7749999999999 | -0.241 | -0.14 | -0.082 |
| 1.7799999999999 | -0.24 | -0.14 | -0.082 |
| 1.784999999999899 | -0.239 | -0.139 | -0.082 |
| 1.789999999999899 | -0.238 | -0.139 | -0.082 |
| 1.794999999999899 | -0.237 | -0.138 | -0.082 |
| 1.799999999999899 | -0.236 | -0.138 | -0.082 |
| 1.804999999999899 | -0.235 | -0.138 | -0.082 |
| 1.809999999999899 | -0.234 | -0.137 | -0.081 |
| 1.814999999999899 | -0.233 | -0.137 | -0.081 |
| 1.819999999999899 | -0.232 | -0.137 | -0.081 |
| 1.824999999999899 | -0.231 | -0.136 | -0.081 |
| 1.829999999999899 | -0.23 | -0.136 | -0.081 |
| 1.834999999999898 | -0.229 | -0.136 | -0.081 |
| 1.839999999999898 | -0.228 | -0.135 | -0.081 |
| 1.844999999999898 | -0.227 | -0.135 | -0.081 |
| 1.849999999999898 | -0.226 | -0.135 | -0.08 |
| 1.854999999999898 | -0.225 | -0.134 | -0.08 |
| 1.859999999999898 | -0.224 | -0.134 | -0.08 |
| 1.864999999999898 | -0.223 | -0.134 | -0.08 |
| 1.869999999999898 | -0.222 | -0.133 | -0.08 |
| 1.874999999999898 | -0.221 | -0.133 | -0.08 |
| 1.879999999999897 | -0.221 | -0.133 | -0.08 |
| 1.884999999999897 | -0.22 | -0.132 | -0.08 |
| 1.889999999999897 | -0.219 | -0.132 | -0.08 |
| 1.894999999999897 | -0.218 | -0.132 | -0.079 |
| 1.899999999999897 | -0.217 | -0.131 | -0.079 |
| 1.904999999999897 | -0.216 | -0.131 | -0.079 |
| 1.909999999999897 | -0.215 | -0.131 | -0.079 |
| 1.914999999999897 | -0.214 | -0.13 | -0.079 |
| 1.919999999999897 | -0.213 | -0.13 | -0.079 |
| 1.924999999999897 | -0.213 | -0.13 | -0.079 |
| 1.929999999999896 | -0.212 | -0.129 | -0.079 |
| 1.934999999999896 | -0.211 | -0.129 | -0.078 |
| 1.939999999999896 | -0.21 | -0.129 | -0.078 |
| 1.944999999999896 | -0.209 | -0.128 | -0.078 |
| 1.949999999999896 | -0.208 | -0.128 | -0.078 |
| 1.954999999999896 | -0.207 | -0.128 | -0.078 |
| 1.959999999999896 | -0.207 | -0.128 | -0.078 |
| 1.964999999999896 | -0.206 | -0.127 | -0.078 |
| 1.969999999999896 | -0.205 | -0.127 | -0.078 |
| 1.974999999999895 | -0.204 | -0.127 | -0.078 |
| 1.979999999999895 | -0.203 | -0.126 | -0.077 |
| 1.984999999999895 | -0.202 | -0.126 | -0.077 |
| 1.989999999999895 | -0.202 | -0.126 | -0.077 |
| 1.994999999999895 | -0.201 | -0.125 | -0.077 |
| 1.999999999999895 | -0.2 | -0.125 | -0.077 |
| 2.004999999999895 | -0.199 | -0.125 | -0.077 |
| 2.009999999999895 | -0.198 | -0.124 | -0.077 |
| 2.014999999999895 | -0.198 | -0.124 | -0.077 |
| 2.019999999999895 | -0.197 | -0.124 | -0.076 |
| 2.024999999999895 | -0.196 | -0.123 | -0.076 |
| 2.029999999999895 | -0.195 | -0.123 | -0.076 |
| 2.034999999999894 | -0.195 | -0.123 | -0.076 |
| 2.039999999999894 | -0.194 | -0.123 | -0.076 |
| 2.044999999999894 | -0.193 | -0.122 | -0.076 |
| 2.049999999999894 | -0.192 | -0.122 | -0.076 |
| 2.054999999999894 | -0.191 | -0.122 | -0.076 |
| 2.059999999999894 | -0.191 | -0.121 | -0.076 |
| 2.064999999999894 | -0.19 | -0.121 | -0.075 |
| 2.069999999999894 | -0.189 | -0.121 | -0.075 |
| 2.074999999999894 | -0.188 | -0.12 | -0.075 |
| 2.079999999999893 | -0.188 | -0.12 | -0.075 |
| 2.084999999999893 | -0.187 | -0.12 | -0.075 |
| 2.089999999999893 | -0.186 | -0.12 | -0.075 |
| 2.094999999999893 | -0.186 | -0.119 | -0.075 |
| 2.099999999999893 | -0.185 | -0.119 | -0.075 |
| 2.104999999999893 | -0.184 | -0.119 | -0.074 |
| 2.109999999999893 | -0.183 | -0.118 | -0.074 |
| 2.114999999999893 | -0.183 | -0.118 | -0.074 |
| 2.119999999999893 | -0.182 | -0.118 | -0.074 |
| 2.124999999999893 | -0.181 | -0.117 | -0.074 |
| 2.129999999999892 | -0.181 | -0.117 | -0.074 |
| 2.134999999999892 | -0.18 | -0.117 | -0.074 |
| 2.139999999999892 | -0.179 | -0.117 | -0.074 |
| 2.144999999999892 | -0.179 | -0.116 | -0.074 |
| 2.149999999999892 | -0.178 | -0.116 | -0.073 |
| 2.154999999999892 | -0.177 | -0.116 | -0.073 |
| 2.159999999999892 | -0.177 | -0.115 | -0.073 |
| 2.164999999999892 | -0.176 | -0.115 | -0.073 |
| 2.169999999999892 | -0.175 | -0.115 | -0.073 |
| 2.174999999999891 | -0.175 | -0.115 | -0.073 |
| 2.179999999999891 | -0.174 | -0.114 | -0.073 |
| 2.184999999999891 | -0.173 | -0.114 | -0.073 |
| 2.189999999999891 | -0.173 | -0.114 | -0.072 |
| 2.194999999999891 | -0.172 | -0.113 | -0.072 |
| 2.199999999999891 | -0.171 | -0.113 | -0.072 |
| 2.204999999999891 | -0.171 | -0.113 | -0.072 |
| 2.209999999999891 | -0.17 | -0.113 | -0.072 |
| 2.214999999999891 | -0.169 | -0.112 | -0.072 |
| 2.21999999999989 | -0.169 | -0.112 | -0.072 |
| 2.22499999999989 | -0.168 | -0.112 | -0.072 |
| 2.22999999999989 | -0.167 | -0.111 | -0.072 |
| 2.23499999999989 | -0.167 | -0.111 | -0.071 |
| 2.23999999999989 | -0.166 | -0.111 | -0.071 |
| 2.24499999999989 | -0.166 | -0.111 | -0.071 |
| 2.24999999999989 | -0.165 | -0.11 | -0.071 |
| 2.25499999999989 | -0.164 | -0.11 | -0.071 |
| 2.25999999999989 | -0.164 | -0.11 | -0.071 |
| 2.26499999999989 | -0.163 | -0.11 | -0.071 |
| 2.269999999999889 | -0.163 | -0.109 | -0.071 |
| 2.274999999999889 | -0.162 | -0.109 | -0.071 |
| 2.279999999999889 | -0.161 | -0.109 | -0.07 |
| 2.284999999999889 | -0.161 | -0.108 | -0.07 |
| 2.289999999999889 | -0.16 | -0.108 | -0.07 |
| 2.294999999999889 | -0.16 | -0.108 | -0.07 |
| 2.299999999999889 | -0.159 | -0.108 | -0.07 |
| 2.304999999999889 | -0.158 | -0.107 | -0.07 |
| 2.309999999999889 | -0.158 | -0.107 | -0.07 |
| 2.314999999999888 | -0.157 | -0.107 | -0.07 |
| 2.319999999999888 | -0.157 | -0.107 | -0.07 |
| 2.324999999999888 | -0.156 | -0.106 | -0.069 |
| 2.329999999999888 | -0.156 | -0.106 | -0.069 |
| 2.334999999999888 | -0.155 | -0.106 | -0.069 |
| 2.339999999999888 | -0.154 | -0.106 | -0.069 |
| 2.344999999999888 | -0.154 | -0.105 | -0.069 |
| 2.349999999999888 | -0.153 | -0.105 | -0.069 |
| 2.354999999999888 | -0.153 | -0.105 | -0.069 |
| 2.359999999999887 | -0.152 | -0.104 | -0.069 |
| 2.364999999999887 | -0.152 | -0.104 | -0.069 |
| 2.369999999999887 | -0.151 | -0.104 | -0.068 |
| 2.374999999999887 | -0.151 | -0.104 | -0.068 |
| 2.379999999999887 | -0.15 | -0.103 | -0.068 |
| 2.384999999999887 | -0.15 | -0.103 | -0.068 |
| 2.389999999999887 | -0.149 | -0.103 | -0.068 |
| 2.394999999999887 | -0.148 | -0.103 | -0.068 |
| 2.399999999999887 | -0.148 | -0.102 | -0.068 |
| 2.404999999999887 | -0.147 | -0.102 | -0.068 |
| 2.409999999999886 | -0.147 | -0.102 | -0.068 |
| 2.414999999999886 | -0.146 | -0.102 | -0.067 |
| 2.419999999999886 | -0.146 | -0.101 | -0.067 |
| 2.424999999999886 | -0.145 | -0.101 | -0.067 |
| 2.429999999999886 | -0.145 | -0.101 | -0.067 |
| 2.434999999999886 | -0.144 | -0.101 | -0.067 |
| 2.439999999999886 | -0.144 | -0.1 | -0.067 |
| 2.444999999999886 | -0.143 | -0.1 | -0.067 |
| 2.449999999999886 | -0.143 | -0.1 | -0.067 |
| 2.454999999999885 | -0.142 | -0.1 | -0.067 |
| 2.459999999999885 | -0.142 | -0.099 | -0.066 |
| 2.464999999999885 | -0.141 | -0.099 | -0.066 |
| 2.469999999999885 | -0.141 | -0.099 | -0.066 |
| 2.474999999999885 | -0.14 | -0.099 | -0.066 |
| 2.479999999999885 | -0.14 | -0.099 | -0.066 |
| 2.484999999999885 | -0.139 | -0.098 | -0.066 |
| 2.489999999999885 | -0.139 | -0.098 | -0.066 |
| 2.494999999999885 | -0.138 | -0.098 | -0.066 |
| 2.499999999999884 | -0.138 | -0.098 | -0.066 |
| 2.504999999999884 | -0.137 | -0.097 | -0.065 |
| 2.509999999999884 | -0.137 | -0.097 | -0.065 |
| 2.514999999999884 | -0.137 | -0.097 | -0.065 |
| 2.519999999999884 | -0.136 | -0.097 | -0.065 |
| 2.524999999999884 | -0.136 | -0.096 | -0.065 |
| 2.529999999999884 | -0.135 | -0.096 | -0.065 |
| 2.534999999999884 | -0.135 | -0.096 | -0.065 |
| 2.539999999999884 | -0.134 | -0.096 | -0.065 |
| 2.544999999999884 | -0.134 | -0.095 | -0.065 |
| 2.549999999999883 | -0.133 | -0.095 | -0.065 |
| 2.554999999999883 | -0.133 | -0.095 | -0.064 |
| 2.559999999999883 | -0.132 | -0.095 | -0.064 |
| 2.564999999999883 | -0.132 | -0.095 | -0.064 |
| 2.569999999999883 | -0.131 | -0.094 | -0.064 |
| 2.574999999999883 | -0.131 | -0.094 | -0.064 |
| 2.579999999999883 | -0.131 | -0.094 | -0.064 |
| 2.584999999999883 | -0.13 | -0.094 | -0.064 |
| 2.589999999999883 | -0.13 | -0.093 | -0.064 |
| 2.594999999999882 | -0.129 | -0.093 | -0.064 |
| 2.599999999999882 | -0.129 | -0.093 | -0.063 |
| 2.604999999999882 | -0.128 | -0.093 | -0.063 |
| 2.609999999999882 | -0.128 | -0.092 | -0.063 |
| 2.614999999999882 | -0.128 | -0.092 | -0.063 |
| 2.619999999999882 | -0.127 | -0.092 | -0.063 |
| 2.624999999999882 | -0.127 | -0.092 | -0.063 |
| 2.629999999999882 | -0.126 | -0.092 | -0.063 |
| 2.634999999999882 | -0.126 | -0.091 | -0.063 |
| 2.639999999999881 | -0.125 | -0.091 | -0.063 |
| 2.644999999999881 | -0.125 | -0.091 | -0.063 |
| 2.649999999999881 | -0.125 | -0.091 | -0.062 |
| 2.654999999999881 | -0.124 | -0.091 | -0.062 |
| 2.659999999999881 | -0.124 | -0.09 | -0.062 |
| 2.664999999999881 | -0.123 | -0.09 | -0.062 |
| 2.669999999999881 | -0.123 | -0.09 | -0.062 |
| 2.674999999999881 | -0.123 | -0.09 | -0.062 |
| 2.679999999999881 | -0.122 | -0.089 | -0.062 |
| 2.68499999999988 | -0.122 | -0.089 | -0.062 |
| 2.68999999999988 | -0.121 | -0.089 | -0.062 |
| 2.69499999999988 | -0.121 | -0.089 | -0.061 |
| 2.69999999999988 | -0.121 | -0.089 | -0.061 |
| 2.70499999999988 | -0.12 | -0.088 | -0.061 |
| 2.70999999999988 | -0.12 | -0.088 | -0.061 |
| 2.71499999999988 | -0.119 | -0.088 | -0.061 |
| 2.71999999999988 | -0.119 | -0.088 | -0.061 |
| 2.72499999999988 | -0.119 | -0.088 | -0.061 |
| 2.72999999999988 | -0.118 | -0.087 | -0.061 |
| 2.734999999999879 | -0.118 | -0.087 | -0.061 |
| 2.739999999999879 | -0.118 | -0.087 | -0.061 |
| 2.744999999999879 | -0.117 | -0.087 | -0.06 |
| 2.749999999999879 | -0.117 | -0.086 | -0.06 |
| 2.754999999999879 | -0.116 | -0.086 | -0.06 |
| 2.759999999999879 | -0.116 | -0.086 | -0.06 |
| 2.764999999999879 | -0.116 | -0.086 | -0.06 |
| 2.769999999999879 | -0.115 | -0.086 | -0.06 |
| 2.774999999999879 | -0.115 | -0.085 | -0.06 |
| 2.779999999999878 | -0.115 | -0.085 | -0.06 |
| 2.784999999999878 | -0.114 | -0.085 | -0.06 |
| 2.789999999999878 | -0.114 | -0.085 | -0.06 |
| 2.794999999999878 | -0.113 | -0.085 | -0.059 |
| 2.799999999999878 | -0.113 | -0.084 | -0.059 |
| 2.804999999999878 | -0.113 | -0.084 | -0.059 |
| 2.809999999999878 | -0.112 | -0.084 | -0.059 |
| 2.814999999999878 | -0.112 | -0.084 | -0.059 |
| 2.819999999999878 | -0.112 | -0.084 | -0.059 |
| 2.824999999999878 | -0.111 | -0.083 | -0.059 |
| 2.829999999999877 | -0.111 | -0.083 | -0.059 |
| 2.834999999999877 | -0.111 | -0.083 | -0.059 |
| 2.839999999999877 | -0.11 | -0.083 | -0.059 |
| 2.844999999999877 | -0.11 | -0.083 | -0.058 |
| 2.849999999999877 | -0.11 | -0.082 | -0.058 |
| 2.854999999999877 | -0.109 | -0.082 | -0.058 |
| 2.859999999999877 | -0.109 | -0.082 | -0.058 |
| 2.864999999999877 | -0.109 | -0.082 | -0.058 |
| 2.869999999999877 | -0.108 | -0.082 | -0.058 |
| 2.874999999999876 | -0.108 | -0.082 | -0.058 |
| 2.879999999999876 | -0.108 | -0.081 | -0.058 |
| 2.884999999999876 | -0.107 | -0.081 | -0.058 |
| 2.889999999999876 | -0.107 | -0.081 | -0.058 |
| 2.894999999999876 | -0.107 | -0.081 | -0.058 |
| 2.899999999999876 | -0.106 | -0.081 | -0.057 |
| 2.904999999999876 | -0.106 | -0.08 | -0.057 |
| 2.909999999999876 | -0.106 | -0.08 | -0.057 |
| 2.914999999999876 | -0.105 | -0.08 | -0.057 |
| 2.919999999999876 | -0.105 | -0.08 | -0.057 |
| 2.924999999999875 | -0.105 | -0.08 | -0.057 |
| 2.929999999999875 | -0.104 | -0.079 | -0.057 |
| 2.934999999999875 | -0.104 | -0.079 | -0.057 |
| 2.939999999999875 | -0.104 | -0.079 | -0.057 |
| 2.944999999999875 | -0.103 | -0.079 | -0.057 |
| 2.949999999999875 | -0.103 | -0.079 | -0.056 |
| 2.954999999999875 | -0.103 | -0.079 | -0.056 |
| 2.959999999999875 | -0.102 | -0.078 | -0.056 |
| 2.964999999999875 | -0.102 | -0.078 | -0.056 |
| 2.969999999999874 | -0.102 | -0.078 | -0.056 |
| 2.974999999999874 | -0.102 | -0.078 | -0.056 |
| 2.979999999999874 | -0.101 | -0.078 | -0.056 |
| 2.984999999999874 | -0.101 | -0.077 | -0.056 |
| 2.989999999999874 | -0.101 | -0.077 | -0.056 |
| 2.994999999999874 | -0.1 | -0.077 | -0.056 |
| 2.999999999999874 | -0.1 | -0.077 | -0.056 |
| 3.004999999999874 | -0.1 | -0.077 | -0.055 |
| 3.009999999999874 | -0.099 | -0.077 | -0.055 |
| 3.014999999999874 | -0.099 | -0.076 | -0.055 |
| 3.019999999999873 | -0.099 | -0.076 | -0.055 |
| 3.024999999999873 | -0.099 | -0.076 | -0.055 |
| 3.029999999999873 | -0.098 | -0.076 | -0.055 |
| 3.034999999999873 | -0.098 | -0.076 | -0.055 |
| 3.039999999999873 | -0.098 | -0.076 | -0.055 |
| 3.044999999999873 | -0.097 | -0.075 | -0.055 |
| 3.049999999999873 | -0.097 | -0.075 | -0.055 |
| 3.054999999999873 | -0.097 | -0.075 | -0.055 |
| 3.059999999999873 | -0.096 | -0.075 | -0.054 |
| 3.064999999999872 | -0.096 | -0.075 | -0.054 |
| 3.069999999999872 | -0.096 | -0.074 | -0.054 |
| 3.074999999999872 | -0.096 | -0.074 | -0.054 |
| 3.079999999999872 | -0.095 | -0.074 | -0.054 |
| 3.084999999999872 | -0.095 | -0.074 | -0.054 |
| 3.089999999999872 | -0.095 | -0.074 | -0.054 |
| 3.094999999999872 | -0.095 | -0.074 | -0.054 |
| 3.099999999999872 | -0.094 | -0.073 | -0.054 |
| 3.104999999999872 | -0.094 | -0.073 | -0.054 |
| 3.109999999999872 | -0.094 | -0.073 | -0.054 |
| 3.114999999999871 | -0.093 | -0.073 | -0.053 |
| 3.119999999999871 | -0.093 | -0.073 | -0.053 |
| 3.124999999999871 | -0.093 | -0.073 | -0.053 |
| 3.129999999999871 | -0.093 | -0.072 | -0.053 |
| 3.134999999999871 | -0.092 | -0.072 | -0.053 |
| 3.139999999999871 | -0.092 | -0.072 | -0.053 |
| 3.144999999999871 | -0.092 | -0.072 | -0.053 |
| 3.149999999999871 | -0.092 | -0.072 | -0.053 |
| 3.154999999999871 | -0.091 | -0.072 | -0.053 |
| 3.15999999999987 | -0.091 | -0.072 | -0.053 |
| 3.16499999999987 | -0.091 | -0.071 | -0.053 |
| 3.16999999999987 | -0.091 | -0.071 | -0.052 |
| 3.17499999999987 | -0.09 | -0.071 | -0.052 |
| 3.17999999999987 | -0.09 | -0.071 | -0.052 |
| 3.18499999999987 | -0.09 | -0.071 | -0.052 |
| 3.18999999999987 | -0.089 | -0.071 | -0.052 |
| 3.19499999999987 | -0.089 | -0.07 | -0.052 |
| 3.19999999999987 | -0.089 | -0.07 | -0.052 |
| 3.204999999999869 | -0.089 | -0.07 | -0.052 |
| 3.209999999999869 | -0.088 | -0.07 | -0.052 |
| 3.214999999999869 | -0.088 | -0.07 | -0.052 |
| 3.219999999999869 | -0.088 | -0.07 | -0.052 |
| 3.224999999999869 | -0.088 | -0.069 | -0.052 |
| 3.229999999999869 | -0.087 | -0.069 | -0.051 |
| 3.234999999999869 | -0.087 | -0.069 | -0.051 |
| 3.239999999999869 | -0.087 | -0.069 | -0.051 |
| 3.244999999999869 | -0.087 | -0.069 | -0.051 |
| 3.249999999999869 | -0.086 | -0.069 | -0.051 |
| 3.254999999999868 | -0.086 | -0.069 | -0.051 |
| 3.259999999999868 | -0.086 | -0.068 | -0.051 |
| 3.264999999999868 | -0.086 | -0.068 | -0.051 |
| 3.269999999999868 | -0.086 | -0.068 | -0.051 |
| 3.274999999999868 | -0.085 | -0.068 | -0.051 |
| 3.279999999999868 | -0.085 | -0.068 | -0.051 |
| 3.284999999999868 | -0.085 | -0.068 | -0.051 |
| 3.289999999999868 | -0.085 | -0.067 | -0.05 |
| 3.294999999999868 | -0.084 | -0.067 | -0.05 |
| 3.299999999999867 | -0.084 | -0.067 | -0.05 |
| 3.304999999999867 | -0.084 | -0.067 | -0.05 |
| 3.309999999999867 | -0.084 | -0.067 | -0.05 |
| 3.314999999999867 | -0.083 | -0.067 | -0.05 |
| 3.319999999999867 | -0.083 | -0.067 | -0.05 |
| 3.324999999999867 | -0.083 | -0.066 | -0.05 |
| 3.329999999999867 | -0.083 | -0.066 | -0.05 |
| 3.334999999999867 | -0.082 | -0.066 | -0.05 |
| 3.339999999999867 | -0.082 | -0.066 | -0.05 |
| 3.344999999999866 | -0.082 | -0.066 | -0.05 |
| 3.349999999999866 | -0.082 | -0.066 | -0.049 |
| 3.354999999999866 | -0.082 | -0.066 | -0.049 |
| 3.359999999999866 | -0.081 | -0.065 | -0.049 |
| 3.364999999999866 | -0.081 | -0.065 | -0.049 |
| 3.369999999999866 | -0.081 | -0.065 | -0.049 |
| 3.374999999999866 | -0.081 | -0.065 | -0.049 |
| 3.379999999999866 | -0.08 | -0.065 | -0.049 |
| 3.384999999999866 | -0.08 | -0.065 | -0.049 |
| 3.389999999999866 | -0.08 | -0.065 | -0.049 |
| 3.394999999999865 | -0.08 | -0.064 | -0.049 |
| 3.399999999999865 | -0.08 | -0.064 | -0.049 |
| 3.404999999999865 | -0.079 | -0.064 | -0.049 |
| 3.409999999999865 | -0.079 | -0.064 | -0.048 |
| 3.414999999999865 | -0.079 | -0.064 | -0.048 |
| 3.419999999999865 | -0.079 | -0.064 | -0.048 |
| 3.424999999999865 | -0.079 | -0.064 | -0.048 |
| 3.429999999999865 | -0.078 | -0.063 | -0.048 |
| 3.434999999999865 | -0.078 | -0.063 | -0.048 |
| 3.439999999999864 | -0.078 | -0.063 | -0.048 |
| 3.444999999999864 | -0.078 | -0.063 | -0.048 |
| 3.449999999999864 | -0.078 | -0.063 | -0.048 |
| 3.454999999999864 | -0.077 | -0.063 | -0.048 |
| 3.459999999999864 | -0.077 | -0.063 | -0.048 |
| 3.464999999999864 | -0.077 | -0.062 | -0.048 |
| 3.469999999999864 | -0.077 | -0.062 | -0.048 |
| 3.474999999999864 | -0.076 | -0.062 | -0.047 |
| 3.479999999999864 | -0.076 | -0.062 | -0.047 |
| 3.484999999999864 | -0.076 | -0.062 | -0.047 |
| 3.489999999999863 | -0.076 | -0.062 | -0.047 |
| 3.494999999999863 | -0.076 | -0.062 | -0.047 |
| 3.499999999999863 | -0.075 | -0.062 | -0.047 |
| 3.504999999999863 | -0.075 | -0.061 | -0.047 |
| 3.509999999999863 | -0.075 | -0.061 | -0.047 |
| 3.514999999999863 | -0.075 | -0.061 | -0.047 |
| 3.519999999999863 | -0.075 | -0.061 | -0.047 |
| 3.524999999999863 | -0.074 | -0.061 | -0.047 |
| 3.529999999999863 | -0.074 | -0.061 | -0.047 |
| 3.534999999999862 | -0.074 | -0.061 | -0.047 |
| 3.539999999999862 | -0.074 | -0.06 | -0.046 |
| 3.544999999999862 | -0.074 | -0.06 | -0.046 |
| 3.549999999999862 | -0.074 | -0.06 | -0.046 |
| 3.554999999999862 | -0.073 | -0.06 | -0.046 |
| 3.559999999999862 | -0.073 | -0.06 | -0.046 |
| 3.564999999999862 | -0.073 | -0.06 | -0.046 |
| 3.569999999999862 | -0.073 | -0.06 | -0.046 |
| 3.574999999999862 | -0.073 | -0.06 | -0.046 |
| 3.579999999999862 | -0.072 | -0.059 | -0.046 |
| 3.584999999999861 | -0.072 | -0.059 | -0.046 |
| 3.589999999999861 | -0.072 | -0.059 | -0.046 |
| 3.594999999999861 | -0.072 | -0.059 | -0.046 |
| 3.599999999999861 | -0.072 | -0.059 | -0.046 |
| 3.604999999999861 | -0.071 | -0.059 | -0.045 |
| 3.609999999999861 | -0.071 | -0.059 | -0.045 |
| 3.614999999999861 | -0.071 | -0.059 | -0.045 |
| 3.619999999999861 | -0.071 | -0.058 | -0.045 |
| 3.62499999999986 | -0.071 | -0.058 | -0.045 |
| 3.62999999999986 | -0.071 | -0.058 | -0.045 |
| 3.63499999999986 | -0.07 | -0.058 | -0.045 |
| 3.63999999999986 | -0.07 | -0.058 | -0.045 |
| 3.64499999999986 | -0.07 | -0.058 | -0.045 |
| 3.64999999999986 | -0.07 | -0.058 | -0.045 |
| 3.65499999999986 | -0.07 | -0.058 | -0.045 |
| 3.65999999999986 | -0.069 | -0.057 | -0.045 |
| 3.66499999999986 | -0.069 | -0.057 | -0.045 |
| 3.669999999999859 | -0.069 | -0.057 | -0.045 |
| 3.674999999999859 | -0.069 | -0.057 | -0.044 |
| 3.679999999999859 | -0.069 | -0.057 | -0.044 |
| 3.684999999999859 | -0.069 | -0.057 | -0.044 |
| 3.689999999999859 | -0.068 | -0.057 | -0.044 |
| 3.694999999999859 | -0.068 | -0.057 | -0.044 |
| 3.699999999999859 | -0.068 | -0.057 | -0.044 |
| 3.704999999999859 | -0.068 | -0.056 | -0.044 |
| 3.709999999999859 | -0.068 | -0.056 | -0.044 |
| 3.714999999999859 | -0.068 | -0.056 | -0.044 |
| 3.719999999999858 | -0.067 | -0.056 | -0.044 |
| 3.724999999999858 | -0.067 | -0.056 | -0.044 |
| 3.729999999999858 | -0.067 | -0.056 | -0.044 |
| 3.734999999999858 | -0.067 | -0.056 | -0.044 |
| 3.739999999999858 | -0.067 | -0.056 | -0.044 |
| 3.744999999999858 | -0.067 | -0.055 | -0.043 |
| 3.749999999999858 | -0.066 | -0.055 | -0.043 |
| 3.754999999999858 | -0.066 | -0.055 | -0.043 |
| 3.759999999999858 | -0.066 | -0.055 | -0.043 |
| 3.764999999999857 | -0.066 | -0.055 | -0.043 |
| 3.769999999999857 | -0.066 | -0.055 | -0.043 |
| 3.774999999999857 | -0.066 | -0.055 | -0.043 |
| 3.779999999999857 | -0.065 | -0.055 | -0.043 |
| 3.784999999999857 | -0.065 | -0.055 | -0.043 |
| 3.789999999999857 | -0.065 | -0.054 | -0.043 |
| 3.794999999999857 | -0.065 | -0.054 | -0.043 |
| 3.799999999999857 | -0.065 | -0.054 | -0.043 |
| 3.804999999999857 | -0.065 | -0.054 | -0.043 |
| 3.809999999999857 | -0.064 | -0.054 | -0.043 |
| 3.814999999999856 | -0.064 | -0.054 | -0.042 |
| 3.819999999999856 | -0.064 | -0.054 | -0.042 |
| 3.824999999999856 | -0.064 | -0.054 | -0.042 |
| 3.829999999999856 | -0.064 | -0.054 | -0.042 |
| 3.834999999999856 | -0.064 | -0.053 | -0.042 |
| 3.839999999999856 | -0.064 | -0.053 | -0.042 |
| 3.844999999999856 | -0.063 | -0.053 | -0.042 |
| 3.849999999999856 | -0.063 | -0.053 | -0.042 |
| 3.854999999999856 | -0.063 | -0.053 | -0.042 |
| 3.859999999999855 | -0.063 | -0.053 | -0.042 |
| 3.864999999999855 | -0.063 | -0.053 | -0.042 |
| 3.869999999999855 | -0.063 | -0.053 | -0.042 |
| 3.874999999999855 | -0.062 | -0.053 | -0.042 |
| 3.879999999999855 | -0.062 | -0.052 | -0.042 |
| 3.884999999999855 | -0.062 | -0.052 | -0.042 |
| 3.889999999999855 | -0.062 | -0.052 | -0.041 |
| 3.894999999999855 | -0.062 | -0.052 | -0.041 |
| 3.899999999999855 | -0.062 | -0.052 | -0.041 |
| 3.904999999999855 | -0.062 | -0.052 | -0.041 |
| 3.909999999999854 | -0.061 | -0.052 | -0.041 |
| 3.914999999999854 | -0.061 | -0.052 | -0.041 |
| 3.919999999999854 | -0.061 | -0.052 | -0.041 |
| 3.924999999999854 | -0.061 | -0.052 | -0.041 |
| 3.929999999999854 | -0.061 | -0.051 | -0.041 |
| 3.934999999999854 | -0.061 | -0.051 | -0.041 |
| 3.939999999999854 | -0.061 | -0.051 | -0.041 |
| 3.944999999999854 | -0.06 | -0.051 | -0.041 |
| 3.949999999999854 | -0.06 | -0.051 | -0.041 |
| 3.954999999999853 | -0.06 | -0.051 | -0.041 |
| 3.959999999999853 | -0.06 | -0.051 | -0.041 |
| 3.964999999999853 | -0.06 | -0.051 | -0.04 |
| 3.969999999999853 | -0.06 | -0.051 | -0.04 |
| 3.974999999999853 | -0.06 | -0.051 | -0.04 |
| 3.979999999999853 | -0.059 | -0.05 | -0.04 |
| 3.984999999999853 | -0.059 | -0.05 | -0.04 |
| 3.989999999999853 | -0.059 | -0.05 | -0.04 |
| 3.994999999999853 | -0.059 | -0.05 | -0.04 |
| 3.999999999999853 | -0.059 | -0.05 | -0.04 |
| 4.004999999999852 | -0.059 | -0.05 | -0.04 |
| 4.009999999999852 | -0.059 | -0.05 | -0.04 |
| 4.014999999999852 | -0.058 | -0.05 | -0.04 |
| 4.019999999999852 | -0.058 | -0.05 | -0.04 |
| 4.024999999999852 | -0.058 | -0.05 | -0.04 |
| 4.029999999999852 | -0.058 | -0.049 | -0.04 |
| 4.034999999999852 | -0.058 | -0.049 | -0.04 |
| 4.039999999999851 | -0.058 | -0.049 | -0.039 |
| 4.044999999999852 | -0.058 | -0.049 | -0.039 |
| 4.049999999999851 | -0.057 | -0.049 | -0.039 |
| 4.054999999999851 | -0.057 | -0.049 | -0.039 |
| 4.059999999999851 | -0.057 | -0.049 | -0.039 |
| 4.064999999999851 | -0.057 | -0.049 | -0.039 |
| 4.069999999999851 | -0.057 | -0.049 | -0.039 |
| 4.074999999999851 | -0.057 | -0.049 | -0.039 |
| 4.07999999999985 | -0.057 | -0.048 | -0.039 |
| 4.084999999999851 | -0.057 | -0.048 | -0.039 |
| 4.08999999999985 | -0.056 | -0.048 | -0.039 |
| 4.094999999999851 | -0.056 | -0.048 | -0.039 |
| 4.09999999999985 | -0.056 | -0.048 | -0.039 |
| 4.10499999999985 | -0.056 | -0.048 | -0.039 |
| 4.10999999999985 | -0.056 | -0.048 | -0.039 |
| 4.11499999999985 | -0.056 | -0.048 | -0.039 |
| 4.11999999999985 | -0.056 | -0.048 | -0.038 |
| 4.12499999999985 | -0.056 | -0.048 | -0.038 |
| 4.12999999999985 | -0.055 | -0.047 | -0.038 |
| 4.13499999999985 | -0.055 | -0.047 | -0.038 |
| 4.13999999999985 | -0.055 | -0.047 | -0.038 |
| 4.144999999999849 | -0.055 | -0.047 | -0.038 |
| 4.14999999999985 | -0.055 | -0.047 | -0.038 |
| 4.154999999999849 | -0.055 | -0.047 | -0.038 |
| 4.15999999999985 | -0.055 | -0.047 | -0.038 |
| 4.164999999999849 | -0.055 | -0.047 | -0.038 |
| 4.169999999999849 | -0.054 | -0.047 | -0.038 |
| 4.174999999999849 | -0.054 | -0.047 | -0.038 |
| 4.179999999999848 | -0.054 | -0.047 | -0.038 |
| 4.184999999999849 | -0.054 | -0.046 | -0.038 |
| 4.189999999999848 | -0.054 | -0.046 | -0.038 |
| 4.194999999999848 | -0.054 | -0.046 | -0.038 |
| 4.199999999999848 | -0.054 | -0.046 | -0.038 |
| 4.204999999999848 | -0.054 | -0.046 | -0.037 |
| 4.209999999999848 | -0.053 | -0.046 | -0.037 |
| 4.214999999999848 | -0.053 | -0.046 | -0.037 |
| 4.219999999999847 | -0.053 | -0.046 | -0.037 |
| 4.224999999999848 | -0.053 | -0.046 | -0.037 |
| 4.229999999999847 | -0.053 | -0.046 | -0.037 |
| 4.234999999999847 | -0.053 | -0.046 | -0.037 |
| 4.239999999999847 | -0.053 | -0.046 | -0.037 |
| 4.244999999999847 | -0.053 | -0.045 | -0.037 |
| 4.249999999999847 | -0.052 | -0.045 | -0.037 |
| 4.254999999999847 | -0.052 | -0.045 | -0.037 |
| 4.259999999999846 | -0.052 | -0.045 | -0.037 |
| 4.264999999999847 | -0.052 | -0.045 | -0.037 |
| 4.269999999999846 | -0.052 | -0.045 | -0.037 |
| 4.274999999999846 | -0.052 | -0.045 | -0.037 |
| 4.279999999999846 | -0.052 | -0.045 | -0.037 |
| 4.284999999999846 | -0.052 | -0.045 | -0.037 |
| 4.289999999999846 | -0.052 | -0.045 | -0.036 |
| 4.294999999999846 | -0.051 | -0.045 | -0.036 |
| 4.299999999999846 | -0.051 | -0.044 | -0.036 |
| 4.304999999999846 | -0.051 | -0.044 | -0.036 |
| 4.309999999999845 | -0.051 | -0.044 | -0.036 |
| 4.314999999999846 | -0.051 | -0.044 | -0.036 |
| 4.319999999999845 | -0.051 | -0.044 | -0.036 |
| 4.324999999999846 | -0.051 | -0.044 | -0.036 |
| 4.329999999999845 | -0.051 | -0.044 | -0.036 |
| 4.334999999999845 | -0.051 | -0.044 | -0.036 |
| 4.339999999999845 | -0.05 | -0.044 | -0.036 |
| 4.344999999999845 | -0.05 | -0.044 | -0.036 |
| 4.349999999999845 | -0.05 | -0.044 | -0.036 |
| 4.354999999999845 | -0.05 | -0.044 | -0.036 |
| 4.359999999999844 | -0.05 | -0.043 | -0.036 |
| 4.364999999999845 | -0.05 | -0.043 | -0.036 |
| 4.369999999999844 | -0.05 | -0.043 | -0.036 |
| 4.374999999999844 | -0.05 | -0.043 | -0.036 |
| 4.379999999999844 | -0.05 | -0.043 | -0.035 |
| 4.384999999999844 | -0.049 | -0.043 | -0.035 |
| 4.389999999999844 | -0.049 | -0.043 | -0.035 |
| 4.394999999999844 | -0.049 | -0.043 | -0.035 |
| 4.399999999999844 | -0.049 | -0.043 | -0.035 |
| 4.404999999999844 | -0.049 | -0.043 | -0.035 |
| 4.409999999999843 | -0.049 | -0.043 | -0.035 |
| 4.414999999999844 | -0.049 | -0.043 | -0.035 |
| 4.419999999999843 | -0.049 | -0.042 | -0.035 |
| 4.424999999999843 | -0.049 | -0.042 | -0.035 |
| 4.429999999999843 | -0.048 | -0.042 | -0.035 |
| 4.434999999999843 | -0.048 | -0.042 | -0.035 |
| 4.439999999999843 | -0.048 | -0.042 | -0.035 |
| 4.444999999999843 | -0.048 | -0.042 | -0.035 |
| 4.449999999999842 | -0.048 | -0.042 | -0.035 |
| 4.454999999999843 | -0.048 | -0.042 | -0.035 |
| 4.459999999999842 | -0.048 | -0.042 | -0.035 |
| 4.464999999999843 | -0.048 | -0.042 | -0.035 |
| 4.469999999999842 | -0.048 | -0.042 | -0.035 |
| 4.474999999999842 | -0.048 | -0.042 | -0.034 |
| 4.479999999999842 | -0.047 | -0.042 | -0.034 |
| 4.484999999999842 | -0.047 | -0.041 | -0.034 |
| 4.489999999999842 | -0.047 | -0.041 | -0.034 |
| 4.494999999999842 | -0.047 | -0.041 | -0.034 |
| 4.499999999999841 | -0.047 | -0.041 | -0.034 |
| 4.504999999999842 | -0.047 | -0.041 | -0.034 |
| 4.509999999999841 | -0.047 | -0.041 | -0.034 |
| 4.514999999999842 | -0.047 | -0.041 | -0.034 |
| 4.519999999999841 | -0.047 | -0.041 | -0.034 |
| 4.524999999999841 | -0.047 | -0.041 | -0.034 |
| 4.529999999999841 | -0.046 | -0.041 | -0.034 |
| 4.534999999999841 | -0.046 | -0.041 | -0.034 |
| 4.53999999999984 | -0.046 | -0.041 | -0.034 |
| 4.544999999999841 | -0.046 | -0.041 | -0.034 |
| 4.54999999999984 | -0.046 | -0.04 | -0.034 |
| 4.554999999999841 | -0.046 | -0.04 | -0.034 |
| 4.55999999999984 | -0.046 | -0.04 | -0.034 |
| 4.564999999999841 | -0.046 | -0.04 | -0.034 |
| 4.56999999999984 | -0.046 | -0.04 | -0.033 |
| 4.57499999999984 | -0.046 | -0.04 | -0.033 |
| 4.57999999999984 | -0.046 | -0.04 | -0.033 |
| 4.58499999999984 | -0.045 | -0.04 | -0.033 |
| 4.58999999999984 | -0.045 | -0.04 | -0.033 |
| 4.59499999999984 | -0.045 | -0.04 | -0.033 |
| 4.59999999999984 | -0.045 | -0.04 | -0.033 |
| 4.60499999999984 | -0.045 | -0.04 | -0.033 |
| 4.60999999999984 | -0.045 | -0.04 | -0.033 |
| 4.614999999999839 | -0.045 | -0.04 | -0.033 |
| 4.61999999999984 | -0.045 | -0.039 | -0.033 |
| 4.624999999999839 | -0.045 | -0.039 | -0.033 |
| 4.62999999999984 | -0.045 | -0.039 | -0.033 |
| 4.634999999999839 | -0.044 | -0.039 | -0.033 |
| 4.639999999999838 | -0.044 | -0.039 | -0.033 |
| 4.644999999999839 | -0.044 | -0.039 | -0.033 |
| 4.649999999999838 | -0.044 | -0.039 | -0.033 |
| 4.654999999999839 | -0.044 | -0.039 | -0.033 |
| 4.659999999999838 | -0.044 | -0.039 | -0.033 |
| 4.664999999999838 | -0.044 | -0.039 | -0.033 |
| 4.669999999999838 | -0.044 | -0.039 | -0.032 |
| 4.674999999999838 | -0.044 | -0.039 | -0.032 |
| 4.679999999999837 | -0.044 | -0.039 | -0.032 |
| 4.684999999999838 | -0.044 | -0.039 | -0.032 |
| 4.689999999999837 | -0.043 | -0.038 | -0.032 |
| 4.694999999999838 | -0.043 | -0.038 | -0.032 |
| 4.699999999999837 | -0.043 | -0.038 | -0.032 |
| 4.704999999999837 | -0.043 | -0.038 | -0.032 |
| 4.709999999999837 | -0.043 | -0.038 | -0.032 |
| 4.714999999999837 | -0.043 | -0.038 | -0.032 |
| 4.719999999999837 | -0.043 | -0.038 | -0.032 |
| 4.724999999999837 | -0.043 | -0.038 | -0.032 |
| 4.729999999999836 | -0.043 | -0.038 | -0.032 |
| 4.734999999999836 | -0.043 | -0.038 | -0.032 |
| 4.739999999999836 | -0.043 | -0.038 | -0.032 |
| 4.744999999999836 | -0.043 | -0.038 | -0.032 |
| 4.749999999999836 | -0.042 | -0.038 | -0.032 |
| 4.754999999999836 | -0.042 | -0.038 | -0.032 |
| 4.759999999999836 | -0.042 | -0.038 | -0.032 |
| 4.764999999999836 | -0.042 | -0.037 | -0.032 |
| 4.769999999999836 | -0.042 | -0.037 | -0.031 |
| 4.774999999999835 | -0.042 | -0.037 | -0.031 |
| 4.779999999999835 | -0.042 | -0.037 | -0.031 |
| 4.784999999999835 | -0.042 | -0.037 | -0.031 |
| 4.789999999999835 | -0.042 | -0.037 | -0.031 |
| 4.794999999999835 | -0.042 | -0.037 | -0.031 |
| 4.799999999999835 | -0.042 | -0.037 | -0.031 |
| 4.804999999999835 | -0.042 | -0.037 | -0.031 |
| 4.809999999999835 | -0.041 | -0.037 | -0.031 |
| 4.814999999999835 | -0.041 | -0.037 | -0.031 |
| 4.819999999999835 | -0.041 | -0.037 | -0.031 |
| 4.824999999999835 | -0.041 | -0.037 | -0.031 |
| 4.829999999999834 | -0.041 | -0.037 | -0.031 |
| 4.834999999999834 | -0.041 | -0.037 | -0.031 |
| 4.839999999999834 | -0.041 | -0.036 | -0.031 |
| 4.844999999999834 | -0.041 | -0.036 | -0.031 |
| 4.849999999999834 | -0.041 | -0.036 | -0.031 |
| 4.854999999999834 | -0.041 | -0.036 | -0.031 |
| 4.859999999999834 | -0.041 | -0.036 | -0.031 |
| 4.864999999999834 | -0.041 | -0.036 | -0.031 |
| 4.869999999999834 | -0.04 | -0.036 | -0.031 |
| 4.874999999999834 | -0.04 | -0.036 | -0.031 |
| 4.879999999999833 | -0.04 | -0.036 | -0.03 |
| 4.884999999999834 | -0.04 | -0.036 | -0.03 |
| 4.889999999999833 | -0.04 | -0.036 | -0.03 |
| 4.894999999999833 | -0.04 | -0.036 | -0.03 |
| 4.899999999999833 | -0.04 | -0.036 | -0.03 |
| 4.904999999999833 | -0.04 | -0.036 | -0.03 |
| 4.909999999999833 | -0.04 | -0.036 | -0.03 |
| 4.914999999999833 | -0.04 | -0.036 | -0.03 |
| 4.919999999999832 | -0.04 | -0.035 | -0.03 |
| 4.924999999999833 | -0.04 | -0.035 | -0.03 |
| 4.929999999999832 | -0.04 | -0.035 | -0.03 |
| 4.934999999999832 | -0.039 | -0.035 | -0.03 |
| 4.939999999999832 | -0.039 | -0.035 | -0.03 |
| 4.944999999999832 | -0.039 | -0.035 | -0.03 |
| 4.949999999999832 | -0.039 | -0.035 | -0.03 |
| 4.954999999999832 | -0.039 | -0.035 | -0.03 |
| 4.959999999999832 | -0.039 | -0.035 | -0.03 |
| 4.964999999999832 | -0.039 | -0.035 | -0.03 |
| 4.969999999999831 | -0.039 | -0.035 | -0.03 |
| 4.974999999999831 | -0.039 | -0.035 | -0.03 |
| 4.97999999999983 | -0.039 | -0.035 | -0.03 |
| 4.984999999999831 | -0.039 | -0.035 | -0.03 |
| 4.98999999999983 | -0.039 | -0.035 | -0.029 |
| 4.994999999999831 | -0.039 | -0.035 | -0.029 |
| 4.99999999999983 | -0.038 | -0.034 | -0.029 |